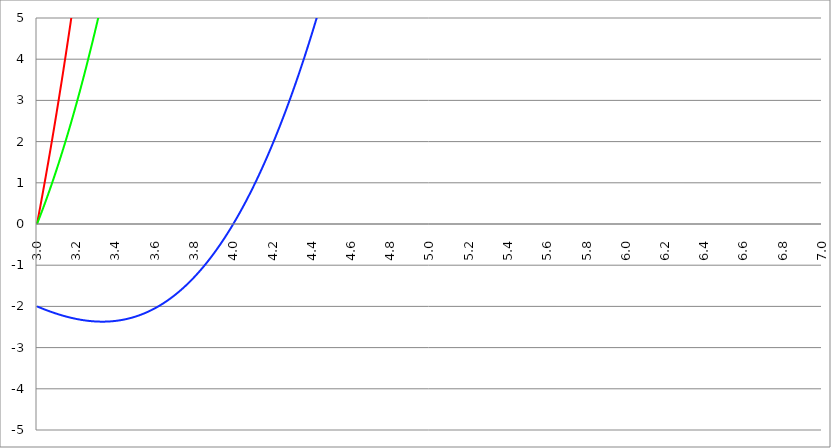
| Category | Series 1 | Series 0 | Series 2 |
|---|---|---|---|
| 3.0 | 0 | 0 | -2 |
| 3.002 | 0.05 | 0.024 | -2.004 |
| 3.004 | 0.1 | 0.048 | -2.008 |
| 3.005999999999999 | 0.151 | 0.072 | -2.012 |
| 3.008 | 0.201 | 0.097 | -2.016 |
| 3.009999999999999 | 0.252 | 0.121 | -2.02 |
| 3.011999999999999 | 0.303 | 0.146 | -2.024 |
| 3.013999999999998 | 0.354 | 0.17 | -2.028 |
| 3.015999999999998 | 0.405 | 0.195 | -2.031 |
| 3.017999999999998 | 0.457 | 0.22 | -2.035 |
| 3.019999999999998 | 0.508 | 0.245 | -2.039 |
| 3.021999999999998 | 0.56 | 0.27 | -2.043 |
| 3.023999999999997 | 0.612 | 0.295 | -2.047 |
| 3.025999999999997 | 0.664 | 0.32 | -2.051 |
| 3.027999999999997 | 0.716 | 0.345 | -2.054 |
| 3.029999999999997 | 0.768 | 0.371 | -2.058 |
| 3.031999999999996 | 0.821 | 0.396 | -2.062 |
| 3.033999999999996 | 0.873 | 0.422 | -2.066 |
| 3.035999999999996 | 0.926 | 0.448 | -2.069 |
| 3.037999999999996 | 0.979 | 0.473 | -2.073 |
| 3.039999999999996 | 1.032 | 0.499 | -2.077 |
| 3.041999999999995 | 1.086 | 0.525 | -2.08 |
| 3.043999999999995 | 1.139 | 0.551 | -2.084 |
| 3.045999999999995 | 1.193 | 0.578 | -2.088 |
| 3.047999999999995 | 1.247 | 0.604 | -2.091 |
| 3.049999999999994 | 1.3 | 0.63 | -2.095 |
| 3.051999999999994 | 1.355 | 0.657 | -2.098 |
| 3.053999999999994 | 1.409 | 0.683 | -2.102 |
| 3.055999999999994 | 1.463 | 0.71 | -2.105 |
| 3.057999999999994 | 1.518 | 0.737 | -2.109 |
| 3.059999999999993 | 1.573 | 0.764 | -2.112 |
| 3.061999999999993 | 1.628 | 0.791 | -2.116 |
| 3.063999999999993 | 1.683 | 0.818 | -2.119 |
| 3.065999999999993 | 1.738 | 0.845 | -2.123 |
| 3.067999999999992 | 1.794 | 0.872 | -2.126 |
| 3.069999999999992 | 1.849 | 0.9 | -2.13 |
| 3.071999999999992 | 1.905 | 0.927 | -2.133 |
| 3.073999999999992 | 1.961 | 0.955 | -2.136 |
| 3.075999999999992 | 2.017 | 0.983 | -2.14 |
| 3.077999999999991 | 2.074 | 1.01 | -2.143 |
| 3.079999999999991 | 2.13 | 1.038 | -2.146 |
| 3.081999999999991 | 2.187 | 1.066 | -2.149 |
| 3.083999999999991 | 2.243 | 1.094 | -2.153 |
| 3.085999999999991 | 2.3 | 1.123 | -2.156 |
| 3.08799999999999 | 2.358 | 1.151 | -2.159 |
| 3.08999999999999 | 2.415 | 1.179 | -2.162 |
| 3.09199999999999 | 2.472 | 1.208 | -2.166 |
| 3.09399999999999 | 2.53 | 1.237 | -2.169 |
| 3.095999999999989 | 2.588 | 1.265 | -2.172 |
| 3.097999999999989 | 2.646 | 1.294 | -2.175 |
| 3.099999999999989 | 2.704 | 1.323 | -2.178 |
| 3.101999999999989 | 2.762 | 1.352 | -2.181 |
| 3.103999999999989 | 2.821 | 1.381 | -2.184 |
| 3.105999999999988 | 2.879 | 1.41 | -2.187 |
| 3.107999999999988 | 2.938 | 1.44 | -2.19 |
| 3.109999999999988 | 2.997 | 1.469 | -2.193 |
| 3.111999999999988 | 3.056 | 1.499 | -2.196 |
| 3.113999999999987 | 3.116 | 1.528 | -2.199 |
| 3.115999999999987 | 3.175 | 1.558 | -2.202 |
| 3.117999999999987 | 3.235 | 1.588 | -2.205 |
| 3.119999999999987 | 3.295 | 1.618 | -2.208 |
| 3.121999999999987 | 3.355 | 1.648 | -2.211 |
| 3.123999999999986 | 3.415 | 1.678 | -2.213 |
| 3.125999999999986 | 3.476 | 1.709 | -2.216 |
| 3.127999999999986 | 3.536 | 1.739 | -2.219 |
| 3.129999999999986 | 3.597 | 1.769 | -2.222 |
| 3.131999999999985 | 3.658 | 1.8 | -2.225 |
| 3.133999999999985 | 3.719 | 1.831 | -2.227 |
| 3.135999999999985 | 3.78 | 1.861 | -2.23 |
| 3.137999999999985 | 3.841 | 1.892 | -2.233 |
| 3.139999999999985 | 3.903 | 1.923 | -2.235 |
| 3.141999999999984 | 3.965 | 1.955 | -2.238 |
| 3.143999999999984 | 4.027 | 1.986 | -2.241 |
| 3.145999999999984 | 4.089 | 2.017 | -2.243 |
| 3.147999999999984 | 4.151 | 2.049 | -2.246 |
| 3.149999999999983 | 4.213 | 2.08 | -2.248 |
| 3.151999999999983 | 4.276 | 2.112 | -2.251 |
| 3.153999999999983 | 4.339 | 2.144 | -2.253 |
| 3.155999999999983 | 4.402 | 2.175 | -2.256 |
| 3.157999999999983 | 4.465 | 2.207 | -2.258 |
| 3.159999999999982 | 4.528 | 2.239 | -2.261 |
| 3.161999999999982 | 4.592 | 2.272 | -2.263 |
| 3.163999999999982 | 4.656 | 2.304 | -2.265 |
| 3.165999999999982 | 4.719 | 2.336 | -2.268 |
| 3.167999999999981 | 4.783 | 2.369 | -2.27 |
| 3.169999999999981 | 4.848 | 2.402 | -2.272 |
| 3.171999999999981 | 4.912 | 2.434 | -2.275 |
| 3.173999999999981 | 4.977 | 2.467 | -2.277 |
| 3.175999999999981 | 5.041 | 2.5 | -2.279 |
| 3.17799999999998 | 5.106 | 2.533 | -2.281 |
| 3.17999999999998 | 5.171 | 2.566 | -2.284 |
| 3.18199999999998 | 5.237 | 2.6 | -2.286 |
| 3.18399999999998 | 5.302 | 2.633 | -2.288 |
| 3.185999999999979 | 5.368 | 2.666 | -2.29 |
| 3.18799999999998 | 5.433 | 2.7 | -2.292 |
| 3.18999999999998 | 5.499 | 2.734 | -2.294 |
| 3.191999999999979 | 5.566 | 2.768 | -2.296 |
| 3.193999999999979 | 5.632 | 2.802 | -2.298 |
| 3.195999999999978 | 5.698 | 2.836 | -2.3 |
| 3.197999999999978 | 5.765 | 2.87 | -2.302 |
| 3.199999999999978 | 5.832 | 2.904 | -2.304 |
| 3.201999999999978 | 5.899 | 2.938 | -2.306 |
| 3.203999999999977 | 5.966 | 2.973 | -2.308 |
| 3.205999999999977 | 6.034 | 3.007 | -2.31 |
| 3.207999999999977 | 6.101 | 3.042 | -2.311 |
| 3.209999999999977 | 6.169 | 3.077 | -2.313 |
| 3.211999999999977 | 6.237 | 3.112 | -2.315 |
| 3.213999999999976 | 6.305 | 3.147 | -2.317 |
| 3.215999999999976 | 6.373 | 3.182 | -2.319 |
| 3.217999999999976 | 6.442 | 3.217 | -2.32 |
| 3.219999999999976 | 6.511 | 3.253 | -2.322 |
| 3.221999999999976 | 6.579 | 3.288 | -2.324 |
| 3.223999999999975 | 6.648 | 3.324 | -2.325 |
| 3.225999999999975 | 6.718 | 3.36 | -2.327 |
| 3.227999999999975 | 6.787 | 3.395 | -2.328 |
| 3.229999999999975 | 6.857 | 3.431 | -2.33 |
| 3.231999999999974 | 6.926 | 3.467 | -2.331 |
| 3.233999999999974 | 6.996 | 3.504 | -2.333 |
| 3.235999999999974 | 7.066 | 3.54 | -2.334 |
| 3.237999999999974 | 7.137 | 3.576 | -2.336 |
| 3.239999999999974 | 7.207 | 3.613 | -2.337 |
| 3.241999999999973 | 7.278 | 3.649 | -2.339 |
| 3.243999999999973 | 7.349 | 3.686 | -2.34 |
| 3.245999999999973 | 7.42 | 3.723 | -2.341 |
| 3.247999999999972 | 7.491 | 3.76 | -2.342 |
| 3.249999999999972 | 7.562 | 3.797 | -2.344 |
| 3.251999999999972 | 7.634 | 3.834 | -2.345 |
| 3.253999999999972 | 7.706 | 3.871 | -2.346 |
| 3.255999999999972 | 7.778 | 3.909 | -2.347 |
| 3.257999999999972 | 7.85 | 3.946 | -2.349 |
| 3.259999999999971 | 7.922 | 3.984 | -2.35 |
| 3.261999999999971 | 7.995 | 4.022 | -2.351 |
| 3.263999999999971 | 8.068 | 4.06 | -2.352 |
| 3.265999999999971 | 8.14 | 4.098 | -2.353 |
| 3.26799999999997 | 8.213 | 4.136 | -2.354 |
| 3.26999999999997 | 8.287 | 4.174 | -2.355 |
| 3.27199999999997 | 8.36 | 4.212 | -2.356 |
| 3.27399999999997 | 8.434 | 4.251 | -2.357 |
| 3.27599999999997 | 8.508 | 4.289 | -2.358 |
| 3.277999999999969 | 8.582 | 4.328 | -2.358 |
| 3.279999999999969 | 8.656 | 4.367 | -2.359 |
| 3.281999999999969 | 8.73 | 4.406 | -2.36 |
| 3.283999999999969 | 8.805 | 4.445 | -2.361 |
| 3.285999999999968 | 8.879 | 4.484 | -2.362 |
| 3.287999999999968 | 8.954 | 4.523 | -2.362 |
| 3.289999999999968 | 9.03 | 4.562 | -2.363 |
| 3.291999999999968 | 9.105 | 4.602 | -2.364 |
| 3.293999999999968 | 9.18 | 4.641 | -2.364 |
| 3.295999999999967 | 9.256 | 4.681 | -2.365 |
| 3.297999999999967 | 9.332 | 4.721 | -2.365 |
| 3.299999999999967 | 9.408 | 4.761 | -2.366 |
| 3.301999999999967 | 9.484 | 4.801 | -2.367 |
| 3.303999999999966 | 9.561 | 4.841 | -2.367 |
| 3.305999999999966 | 9.637 | 4.882 | -2.367 |
| 3.307999999999966 | 9.714 | 4.922 | -2.368 |
| 3.309999999999966 | 9.791 | 4.963 | -2.368 |
| 3.311999999999966 | 9.868 | 5.003 | -2.369 |
| 3.313999999999965 | 9.946 | 5.044 | -2.369 |
| 3.315999999999965 | 10.023 | 5.085 | -2.369 |
| 3.317999999999965 | 10.101 | 5.126 | -2.369 |
| 3.319999999999965 | 10.179 | 5.167 | -2.37 |
| 3.321999999999964 | 10.257 | 5.208 | -2.37 |
| 3.323999999999964 | 10.336 | 5.25 | -2.37 |
| 3.325999999999964 | 10.414 | 5.291 | -2.37 |
| 3.327999999999964 | 10.493 | 5.333 | -2.37 |
| 3.329999999999964 | 10.572 | 5.375 | -2.37 |
| 3.331999999999963 | 10.651 | 5.416 | -2.37 |
| 3.333999999999963 | 10.73 | 5.458 | -2.37 |
| 3.335999999999963 | 10.81 | 5.501 | -2.37 |
| 3.337999999999963 | 10.889 | 5.543 | -2.37 |
| 3.339999999999963 | 10.969 | 5.585 | -2.37 |
| 3.341999999999962 | 11.049 | 5.628 | -2.37 |
| 3.343999999999962 | 11.13 | 5.67 | -2.37 |
| 3.345999999999962 | 11.21 | 5.713 | -2.37 |
| 3.347999999999962 | 11.291 | 5.756 | -2.37 |
| 3.349999999999961 | 11.371 | 5.799 | -2.369 |
| 3.351999999999961 | 11.453 | 5.842 | -2.369 |
| 3.353999999999961 | 11.534 | 5.885 | -2.369 |
| 3.355999999999961 | 11.615 | 5.928 | -2.368 |
| 3.357999999999961 | 11.697 | 5.972 | -2.368 |
| 3.35999999999996 | 11.779 | 6.015 | -2.367 |
| 3.36199999999996 | 11.861 | 6.059 | -2.367 |
| 3.36399999999996 | 11.943 | 6.103 | -2.367 |
| 3.36599999999996 | 12.025 | 6.147 | -2.366 |
| 3.367999999999959 | 12.108 | 6.191 | -2.365 |
| 3.369999999999959 | 12.191 | 6.235 | -2.365 |
| 3.371999999999959 | 12.274 | 6.279 | -2.364 |
| 3.373999999999959 | 12.357 | 6.323 | -2.364 |
| 3.375999999999959 | 12.44 | 6.368 | -2.363 |
| 3.377999999999958 | 12.524 | 6.413 | -2.362 |
| 3.379999999999958 | 12.607 | 6.457 | -2.361 |
| 3.381999999999958 | 12.691 | 6.502 | -2.361 |
| 3.383999999999958 | 12.776 | 6.547 | -2.36 |
| 3.385999999999957 | 12.86 | 6.592 | -2.359 |
| 3.387999999999957 | 12.945 | 6.638 | -2.358 |
| 3.389999999999957 | 13.029 | 6.683 | -2.357 |
| 3.391999999999957 | 13.114 | 6.729 | -2.356 |
| 3.393999999999957 | 13.199 | 6.774 | -2.355 |
| 3.395999999999956 | 13.285 | 6.82 | -2.354 |
| 3.397999999999956 | 13.37 | 6.866 | -2.353 |
| 3.399999999999956 | 13.456 | 6.912 | -2.352 |
| 3.401999999999956 | 13.542 | 6.958 | -2.351 |
| 3.403999999999955 | 13.628 | 7.004 | -2.35 |
| 3.405999999999955 | 13.714 | 7.051 | -2.348 |
| 3.407999999999955 | 13.801 | 7.097 | -2.347 |
| 3.409999999999955 | 13.888 | 7.144 | -2.346 |
| 3.411999999999955 | 13.975 | 7.191 | -2.345 |
| 3.413999999999954 | 14.062 | 7.238 | -2.343 |
| 3.415999999999954 | 14.149 | 7.285 | -2.342 |
| 3.417999999999954 | 14.237 | 7.332 | -2.34 |
| 3.419999999999954 | 14.324 | 7.379 | -2.339 |
| 3.421999999999953 | 14.412 | 7.426 | -2.338 |
| 3.423999999999953 | 14.5 | 7.474 | -2.336 |
| 3.425999999999953 | 14.589 | 7.522 | -2.334 |
| 3.427999999999953 | 14.677 | 7.569 | -2.333 |
| 3.429999999999953 | 14.766 | 7.617 | -2.331 |
| 3.431999999999952 | 14.855 | 7.665 | -2.33 |
| 3.433999999999952 | 14.944 | 7.714 | -2.328 |
| 3.435999999999952 | 15.033 | 7.762 | -2.326 |
| 3.437999999999952 | 15.123 | 7.81 | -2.324 |
| 3.439999999999952 | 15.213 | 7.859 | -2.322 |
| 3.441999999999951 | 15.303 | 7.907 | -2.321 |
| 3.443999999999951 | 15.393 | 7.956 | -2.319 |
| 3.445999999999951 | 15.483 | 8.005 | -2.317 |
| 3.447999999999951 | 15.574 | 8.054 | -2.315 |
| 3.44999999999995 | 15.664 | 8.103 | -2.313 |
| 3.45199999999995 | 15.755 | 8.153 | -2.311 |
| 3.45399999999995 | 15.847 | 8.202 | -2.309 |
| 3.45599999999995 | 15.938 | 8.252 | -2.306 |
| 3.45799999999995 | 16.03 | 8.301 | -2.304 |
| 3.459999999999949 | 16.121 | 8.351 | -2.302 |
| 3.461999999999949 | 16.213 | 8.401 | -2.3 |
| 3.463999999999949 | 16.306 | 8.451 | -2.298 |
| 3.465999999999949 | 16.398 | 8.501 | -2.295 |
| 3.467999999999948 | 16.49 | 8.552 | -2.293 |
| 3.469999999999948 | 16.583 | 8.602 | -2.291 |
| 3.471999999999948 | 16.676 | 8.653 | -2.288 |
| 3.473999999999948 | 16.77 | 8.704 | -2.286 |
| 3.475999999999948 | 16.863 | 8.754 | -2.283 |
| 3.477999999999947 | 16.957 | 8.805 | -2.281 |
| 3.479999999999947 | 17.05 | 8.857 | -2.278 |
| 3.481999999999947 | 17.144 | 8.908 | -2.275 |
| 3.483999999999947 | 17.239 | 8.959 | -2.273 |
| 3.485999999999946 | 17.333 | 9.011 | -2.27 |
| 3.487999999999946 | 17.428 | 9.062 | -2.267 |
| 3.489999999999946 | 17.523 | 9.114 | -2.265 |
| 3.491999999999946 | 17.618 | 9.166 | -2.262 |
| 3.493999999999946 | 17.713 | 9.218 | -2.259 |
| 3.495999999999945 | 17.808 | 9.27 | -2.256 |
| 3.497999999999945 | 17.904 | 9.323 | -2.253 |
| 3.499999999999945 | 18 | 9.375 | -2.25 |
| 3.501999999999945 | 18.096 | 9.428 | -2.247 |
| 3.503999999999944 | 18.192 | 9.48 | -2.244 |
| 3.505999999999944 | 18.289 | 9.533 | -2.241 |
| 3.507999999999944 | 18.386 | 9.586 | -2.238 |
| 3.509999999999944 | 18.483 | 9.639 | -2.234 |
| 3.511999999999944 | 18.58 | 9.692 | -2.231 |
| 3.513999999999943 | 18.677 | 9.746 | -2.228 |
| 3.515999999999943 | 18.775 | 9.799 | -2.225 |
| 3.517999999999943 | 18.872 | 9.853 | -2.221 |
| 3.519999999999943 | 18.97 | 9.907 | -2.218 |
| 3.521999999999943 | 19.069 | 9.961 | -2.215 |
| 3.523999999999942 | 19.167 | 10.015 | -2.211 |
| 3.525999999999942 | 19.266 | 10.069 | -2.208 |
| 3.527999999999942 | 19.364 | 10.123 | -2.204 |
| 3.529999999999942 | 19.464 | 10.177 | -2.2 |
| 3.531999999999941 | 19.563 | 10.232 | -2.197 |
| 3.533999999999941 | 19.662 | 10.287 | -2.193 |
| 3.535999999999941 | 19.762 | 10.342 | -2.189 |
| 3.537999999999941 | 19.862 | 10.396 | -2.186 |
| 3.539999999999941 | 19.962 | 10.452 | -2.182 |
| 3.54199999999994 | 20.062 | 10.507 | -2.178 |
| 3.54399999999994 | 20.163 | 10.562 | -2.174 |
| 3.54599999999994 | 20.263 | 10.618 | -2.17 |
| 3.54799999999994 | 20.364 | 10.673 | -2.166 |
| 3.549999999999939 | 20.465 | 10.729 | -2.162 |
| 3.551999999999939 | 20.567 | 10.785 | -2.158 |
| 3.553999999999939 | 20.668 | 10.841 | -2.154 |
| 3.555999999999939 | 20.77 | 10.897 | -2.15 |
| 3.557999999999939 | 20.872 | 10.954 | -2.146 |
| 3.559999999999938 | 20.974 | 11.01 | -2.142 |
| 3.561999999999938 | 21.077 | 11.067 | -2.137 |
| 3.563999999999938 | 21.18 | 11.123 | -2.133 |
| 3.565999999999938 | 21.282 | 11.18 | -2.129 |
| 3.567999999999937 | 21.385 | 11.237 | -2.124 |
| 3.569999999999937 | 21.489 | 11.294 | -2.12 |
| 3.571999999999937 | 21.592 | 11.352 | -2.115 |
| 3.573999999999937 | 21.696 | 11.409 | -2.111 |
| 3.575999999999937 | 21.8 | 11.467 | -2.106 |
| 3.577999999999936 | 21.904 | 11.524 | -2.102 |
| 3.579999999999936 | 22.008 | 11.582 | -2.097 |
| 3.581999999999936 | 22.113 | 11.64 | -2.092 |
| 3.583999999999936 | 22.218 | 11.698 | -2.088 |
| 3.585999999999935 | 22.323 | 11.756 | -2.083 |
| 3.587999999999935 | 22.428 | 11.815 | -2.078 |
| 3.589999999999935 | 22.534 | 11.873 | -2.073 |
| 3.591999999999935 | 22.639 | 11.932 | -2.068 |
| 3.593999999999935 | 22.745 | 11.991 | -2.063 |
| 3.595999999999934 | 22.851 | 12.05 | -2.058 |
| 3.597999999999934 | 22.957 | 12.109 | -2.053 |
| 3.599999999999934 | 23.064 | 12.168 | -2.048 |
| 3.601999999999934 | 23.171 | 12.227 | -2.043 |
| 3.603999999999933 | 23.278 | 12.287 | -2.038 |
| 3.605999999999933 | 23.385 | 12.346 | -2.032 |
| 3.607999999999933 | 23.492 | 12.406 | -2.027 |
| 3.609999999999933 | 23.6 | 12.466 | -2.022 |
| 3.611999999999933 | 23.708 | 12.526 | -2.016 |
| 3.613999999999932 | 23.816 | 12.586 | -2.011 |
| 3.615999999999932 | 23.924 | 12.647 | -2.006 |
| 3.617999999999932 | 24.033 | 12.707 | -2 |
| 3.619999999999932 | 24.141 | 12.768 | -1.995 |
| 3.621999999999931 | 24.25 | 12.829 | -1.989 |
| 3.623999999999931 | 24.359 | 12.889 | -1.983 |
| 3.625999999999931 | 24.469 | 12.95 | -1.978 |
| 3.627999999999931 | 24.578 | 13.012 | -1.972 |
| 3.629999999999931 | 24.688 | 13.073 | -1.966 |
| 3.63199999999993 | 24.798 | 13.134 | -1.96 |
| 3.63399999999993 | 24.908 | 13.196 | -1.954 |
| 3.63599999999993 | 25.019 | 13.258 | -1.948 |
| 3.63799999999993 | 25.13 | 13.32 | -1.943 |
| 3.639999999999929 | 25.241 | 13.382 | -1.937 |
| 3.641999999999929 | 25.352 | 13.444 | -1.93 |
| 3.643999999999929 | 25.463 | 13.506 | -1.924 |
| 3.645999999999929 | 25.575 | 13.569 | -1.918 |
| 3.647999999999929 | 25.686 | 13.631 | -1.912 |
| 3.649999999999928 | 25.798 | 13.694 | -1.906 |
| 3.651999999999928 | 25.911 | 13.757 | -1.899 |
| 3.653999999999928 | 26.023 | 13.82 | -1.893 |
| 3.655999999999928 | 26.136 | 13.883 | -1.887 |
| 3.657999999999927 | 26.249 | 13.946 | -1.88 |
| 3.659999999999927 | 26.362 | 14.01 | -1.874 |
| 3.661999999999927 | 26.475 | 14.073 | -1.867 |
| 3.663999999999927 | 26.589 | 14.137 | -1.861 |
| 3.665999999999927 | 26.703 | 14.201 | -1.854 |
| 3.667999999999926 | 26.817 | 14.265 | -1.847 |
| 3.669999999999926 | 26.931 | 14.329 | -1.841 |
| 3.671999999999926 | 27.046 | 14.393 | -1.834 |
| 3.673999999999926 | 27.16 | 14.458 | -1.827 |
| 3.675999999999925 | 27.275 | 14.522 | -1.82 |
| 3.677999999999925 | 27.39 | 14.587 | -1.813 |
| 3.679999999999925 | 27.506 | 14.652 | -1.806 |
| 3.681999999999925 | 27.621 | 14.717 | -1.799 |
| 3.683999999999925 | 27.737 | 14.782 | -1.792 |
| 3.685999999999924 | 27.853 | 14.848 | -1.785 |
| 3.687999999999924 | 27.97 | 14.913 | -1.778 |
| 3.689999999999924 | 28.086 | 14.979 | -1.771 |
| 3.691999999999924 | 28.203 | 15.044 | -1.764 |
| 3.693999999999923 | 28.32 | 15.11 | -1.756 |
| 3.695999999999923 | 28.437 | 15.176 | -1.749 |
| 3.697999999999923 | 28.554 | 15.243 | -1.741 |
| 3.699999999999923 | 28.672 | 15.309 | -1.734 |
| 3.701999999999923 | 28.79 | 15.375 | -1.726 |
| 3.703999999999922 | 28.908 | 15.442 | -1.719 |
| 3.705999999999922 | 29.026 | 15.509 | -1.711 |
| 3.707999999999922 | 29.145 | 15.576 | -1.704 |
| 3.709999999999922 | 29.264 | 15.643 | -1.696 |
| 3.711999999999922 | 29.383 | 15.71 | -1.688 |
| 3.713999999999921 | 29.502 | 15.778 | -1.68 |
| 3.715999999999921 | 29.621 | 15.845 | -1.673 |
| 3.717999999999921 | 29.741 | 15.913 | -1.665 |
| 3.719999999999921 | 29.861 | 15.981 | -1.657 |
| 3.72199999999992 | 29.981 | 16.049 | -1.649 |
| 3.72399999999992 | 30.102 | 16.117 | -1.641 |
| 3.72599999999992 | 30.222 | 16.185 | -1.633 |
| 3.72799999999992 | 30.343 | 16.253 | -1.624 |
| 3.72999999999992 | 30.464 | 16.322 | -1.616 |
| 3.731999999999919 | 30.585 | 16.391 | -1.608 |
| 3.73399999999992 | 30.707 | 16.459 | -1.6 |
| 3.735999999999919 | 30.829 | 16.528 | -1.591 |
| 3.737999999999919 | 30.951 | 16.598 | -1.583 |
| 3.739999999999918 | 31.073 | 16.667 | -1.574 |
| 3.741999999999918 | 31.195 | 16.736 | -1.566 |
| 3.743999999999918 | 31.318 | 16.806 | -1.557 |
| 3.745999999999918 | 31.441 | 16.876 | -1.549 |
| 3.747999999999917 | 31.564 | 16.946 | -1.54 |
| 3.749999999999917 | 31.687 | 17.016 | -1.531 |
| 3.751999999999917 | 31.811 | 17.086 | -1.522 |
| 3.753999999999917 | 31.935 | 17.156 | -1.514 |
| 3.755999999999917 | 32.059 | 17.227 | -1.505 |
| 3.757999999999916 | 32.183 | 17.297 | -1.496 |
| 3.759999999999916 | 32.308 | 17.368 | -1.487 |
| 3.761999999999916 | 32.433 | 17.439 | -1.478 |
| 3.763999999999916 | 32.558 | 17.51 | -1.469 |
| 3.765999999999916 | 32.683 | 17.581 | -1.46 |
| 3.767999999999915 | 32.808 | 17.653 | -1.45 |
| 3.769999999999915 | 32.934 | 17.724 | -1.441 |
| 3.771999999999915 | 33.06 | 17.796 | -1.432 |
| 3.773999999999915 | 33.186 | 17.868 | -1.422 |
| 3.775999999999914 | 33.313 | 17.94 | -1.413 |
| 3.777999999999914 | 33.439 | 18.012 | -1.404 |
| 3.779999999999914 | 33.566 | 18.084 | -1.394 |
| 3.781999999999914 | 33.693 | 18.157 | -1.385 |
| 3.783999999999913 | 33.821 | 18.23 | -1.375 |
| 3.785999999999913 | 33.948 | 18.302 | -1.365 |
| 3.787999999999913 | 34.076 | 18.375 | -1.356 |
| 3.789999999999913 | 34.204 | 18.448 | -1.346 |
| 3.791999999999913 | 34.332 | 18.522 | -1.336 |
| 3.793999999999912 | 34.461 | 18.595 | -1.326 |
| 3.795999999999912 | 34.59 | 18.668 | -1.316 |
| 3.797999999999912 | 34.719 | 18.742 | -1.306 |
| 3.799999999999912 | 34.848 | 18.816 | -1.296 |
| 3.801999999999912 | 34.977 | 18.89 | -1.286 |
| 3.803999999999911 | 35.107 | 18.964 | -1.276 |
| 3.805999999999911 | 35.237 | 19.038 | -1.266 |
| 3.807999999999911 | 35.367 | 19.113 | -1.255 |
| 3.809999999999911 | 35.498 | 19.188 | -1.245 |
| 3.811999999999911 | 35.628 | 19.262 | -1.235 |
| 3.81399999999991 | 35.759 | 19.337 | -1.224 |
| 3.81599999999991 | 35.89 | 19.412 | -1.214 |
| 3.81799999999991 | 36.022 | 19.488 | -1.203 |
| 3.81999999999991 | 36.153 | 19.563 | -1.192 |
| 3.821999999999909 | 36.285 | 19.638 | -1.182 |
| 3.823999999999909 | 36.417 | 19.714 | -1.171 |
| 3.825999999999909 | 36.55 | 19.79 | -1.16 |
| 3.827999999999909 | 36.682 | 19.866 | -1.15 |
| 3.829999999999909 | 36.815 | 19.942 | -1.139 |
| 3.831999999999908 | 36.948 | 20.018 | -1.128 |
| 3.833999999999908 | 37.081 | 20.095 | -1.117 |
| 3.835999999999908 | 37.215 | 20.172 | -1.106 |
| 3.837999999999908 | 37.349 | 20.248 | -1.095 |
| 3.839999999999907 | 37.483 | 20.325 | -1.083 |
| 3.841999999999907 | 37.617 | 20.402 | -1.072 |
| 3.843999999999907 | 37.752 | 20.48 | -1.061 |
| 3.845999999999907 | 37.886 | 20.557 | -1.05 |
| 3.847999999999907 | 38.021 | 20.635 | -1.038 |
| 3.849999999999906 | 38.156 | 20.712 | -1.027 |
| 3.851999999999906 | 38.292 | 20.79 | -1.015 |
| 3.853999999999906 | 38.428 | 20.868 | -1.004 |
| 3.855999999999906 | 38.564 | 20.946 | -0.992 |
| 3.857999999999905 | 38.7 | 21.025 | -0.98 |
| 3.859999999999905 | 38.836 | 21.103 | -0.969 |
| 3.861999999999905 | 38.973 | 21.182 | -0.957 |
| 3.863999999999905 | 39.11 | 21.261 | -0.945 |
| 3.865999999999905 | 39.247 | 21.34 | -0.933 |
| 3.867999999999904 | 39.384 | 21.419 | -0.921 |
| 3.869999999999904 | 39.522 | 21.498 | -0.909 |
| 3.871999999999904 | 39.66 | 21.578 | -0.897 |
| 3.873999999999904 | 39.798 | 21.657 | -0.885 |
| 3.875999999999903 | 39.936 | 21.737 | -0.873 |
| 3.877999999999903 | 40.075 | 21.817 | -0.861 |
| 3.879999999999903 | 40.214 | 21.897 | -0.848 |
| 3.881999999999903 | 40.353 | 21.977 | -0.836 |
| 3.883999999999903 | 40.492 | 22.058 | -0.823 |
| 3.885999999999902 | 40.632 | 22.138 | -0.811 |
| 3.887999999999902 | 40.772 | 22.219 | -0.798 |
| 3.889999999999902 | 40.912 | 22.3 | -0.786 |
| 3.891999999999902 | 41.052 | 22.381 | -0.773 |
| 3.893999999999901 | 41.193 | 22.462 | -0.76 |
| 3.895999999999901 | 41.334 | 22.544 | -0.748 |
| 3.897999999999901 | 41.475 | 22.625 | -0.735 |
| 3.899999999999901 | 41.616 | 22.707 | -0.722 |
| 3.901999999999901 | 41.758 | 22.789 | -0.709 |
| 3.9039999999999 | 41.899 | 22.871 | -0.696 |
| 3.9059999999999 | 42.041 | 22.953 | -0.683 |
| 3.9079999999999 | 42.184 | 23.035 | -0.67 |
| 3.9099999999999 | 42.326 | 23.118 | -0.657 |
| 3.9119999999999 | 42.469 | 23.201 | -0.643 |
| 3.913999999999899 | 42.612 | 23.283 | -0.63 |
| 3.915999999999899 | 42.755 | 23.366 | -0.617 |
| 3.917999999999899 | 42.899 | 23.45 | -0.603 |
| 3.919999999999899 | 43.043 | 23.533 | -0.59 |
| 3.921999999999898 | 43.187 | 23.616 | -0.576 |
| 3.923999999999898 | 43.331 | 23.7 | -0.563 |
| 3.925999999999898 | 43.476 | 23.784 | -0.549 |
| 3.927999999999898 | 43.62 | 23.868 | -0.535 |
| 3.929999999999898 | 43.765 | 23.952 | -0.521 |
| 3.931999999999897 | 43.911 | 24.036 | -0.508 |
| 3.933999999999897 | 44.056 | 24.121 | -0.494 |
| 3.935999999999897 | 44.202 | 24.205 | -0.48 |
| 3.937999999999897 | 44.348 | 24.29 | -0.466 |
| 3.939999999999896 | 44.494 | 24.375 | -0.452 |
| 3.941999999999896 | 44.641 | 24.46 | -0.437 |
| 3.943999999999896 | 44.788 | 24.545 | -0.423 |
| 3.945999999999896 | 44.935 | 24.631 | -0.409 |
| 3.947999999999896 | 45.082 | 24.716 | -0.395 |
| 3.949999999999895 | 45.229 | 24.802 | -0.38 |
| 3.951999999999895 | 45.377 | 24.888 | -0.366 |
| 3.953999999999895 | 45.525 | 24.974 | -0.351 |
| 3.955999999999895 | 45.674 | 25.06 | -0.337 |
| 3.957999999999894 | 45.822 | 25.147 | -0.322 |
| 3.959999999999894 | 45.971 | 25.233 | -0.307 |
| 3.961999999999894 | 46.12 | 25.32 | -0.293 |
| 3.963999999999894 | 46.269 | 25.407 | -0.278 |
| 3.965999999999894 | 46.419 | 25.494 | -0.263 |
| 3.967999999999893 | 46.569 | 25.581 | -0.248 |
| 3.969999999999893 | 46.719 | 25.669 | -0.233 |
| 3.971999999999893 | 46.869 | 25.756 | -0.218 |
| 3.973999999999893 | 47.02 | 25.844 | -0.203 |
| 3.975999999999892 | 47.17 | 25.932 | -0.187 |
| 3.977999999999892 | 47.321 | 26.02 | -0.172 |
| 3.979999999999892 | 47.473 | 26.108 | -0.157 |
| 3.981999999999892 | 47.624 | 26.197 | -0.141 |
| 3.983999999999892 | 47.776 | 26.285 | -0.126 |
| 3.985999999999891 | 47.928 | 26.374 | -0.11 |
| 3.987999999999891 | 48.081 | 26.463 | -0.095 |
| 3.989999999999891 | 48.233 | 26.552 | -0.079 |
| 3.991999999999891 | 48.386 | 26.641 | -0.063 |
| 3.99399999999989 | 48.539 | 26.731 | -0.048 |
| 3.99599999999989 | 48.693 | 26.82 | -0.032 |
| 3.99799999999989 | 48.846 | 26.91 | -0.016 |
| 3.99999999999989 | 49 | 27 | 0 |
| 4.00199999999989 | 49.154 | 27.09 | 0.016 |
| 4.00399999999989 | 49.309 | 27.18 | 0.032 |
| 4.00599999999989 | 49.463 | 27.271 | 0.048 |
| 4.007999999999889 | 49.618 | 27.361 | 0.065 |
| 4.009999999999888 | 49.773 | 27.452 | 0.081 |
| 4.011999999999888 | 49.929 | 27.543 | 0.097 |
| 4.013999999999888 | 50.084 | 27.634 | 0.114 |
| 4.015999999999888 | 50.24 | 27.725 | 0.13 |
| 4.017999999999888 | 50.396 | 27.817 | 0.147 |
| 4.019999999999887 | 50.553 | 27.908 | 0.163 |
| 4.021999999999887 | 50.71 | 28 | 0.18 |
| 4.023999999999887 | 50.866 | 28.092 | 0.197 |
| 4.025999999999887 | 51.024 | 28.184 | 0.213 |
| 4.027999999999887 | 51.181 | 28.277 | 0.23 |
| 4.029999999999886 | 51.339 | 28.369 | 0.247 |
| 4.031999999999886 | 51.497 | 28.462 | 0.264 |
| 4.033999999999886 | 51.655 | 28.554 | 0.281 |
| 4.035999999999885 | 51.814 | 28.647 | 0.298 |
| 4.037999999999885 | 51.972 | 28.74 | 0.316 |
| 4.039999999999885 | 52.131 | 28.834 | 0.333 |
| 4.041999999999885 | 52.291 | 28.927 | 0.35 |
| 4.043999999999885 | 52.45 | 29.021 | 0.368 |
| 4.045999999999884 | 52.61 | 29.115 | 0.385 |
| 4.047999999999884 | 52.77 | 29.209 | 0.403 |
| 4.049999999999884 | 52.93 | 29.303 | 0.42 |
| 4.051999999999884 | 53.091 | 29.397 | 0.438 |
| 4.053999999999884 | 53.252 | 29.492 | 0.456 |
| 4.055999999999884 | 53.413 | 29.586 | 0.473 |
| 4.057999999999883 | 53.574 | 29.681 | 0.491 |
| 4.059999999999883 | 53.736 | 29.776 | 0.509 |
| 4.061999999999883 | 53.898 | 29.871 | 0.527 |
| 4.063999999999883 | 54.06 | 29.967 | 0.545 |
| 4.065999999999883 | 54.223 | 30.062 | 0.563 |
| 4.067999999999882 | 54.385 | 30.158 | 0.582 |
| 4.069999999999882 | 54.548 | 30.254 | 0.6 |
| 4.071999999999881 | 54.711 | 30.35 | 0.618 |
| 4.073999999999881 | 54.875 | 30.446 | 0.637 |
| 4.075999999999881 | 55.039 | 30.543 | 0.655 |
| 4.077999999999881 | 55.203 | 30.639 | 0.674 |
| 4.07999999999988 | 55.367 | 30.736 | 0.692 |
| 4.08199999999988 | 55.531 | 30.833 | 0.711 |
| 4.08399999999988 | 55.696 | 30.93 | 0.73 |
| 4.08599999999988 | 55.861 | 31.027 | 0.748 |
| 4.08799999999988 | 56.027 | 31.125 | 0.767 |
| 4.08999999999988 | 56.192 | 31.222 | 0.786 |
| 4.09199999999988 | 56.358 | 31.32 | 0.805 |
| 4.09399999999988 | 56.524 | 31.418 | 0.824 |
| 4.09599999999988 | 56.69 | 31.516 | 0.843 |
| 4.09799999999988 | 56.857 | 31.615 | 0.863 |
| 4.099999999999878 | 57.024 | 31.713 | 0.882 |
| 4.101999999999878 | 57.191 | 31.812 | 0.901 |
| 4.103999999999878 | 57.359 | 31.911 | 0.921 |
| 4.105999999999878 | 57.526 | 32.01 | 0.94 |
| 4.107999999999878 | 57.694 | 32.109 | 0.96 |
| 4.109999999999877 | 57.863 | 32.208 | 0.979 |
| 4.111999999999877 | 58.031 | 32.308 | 0.999 |
| 4.113999999999877 | 58.2 | 32.407 | 1.019 |
| 4.115999999999877 | 58.369 | 32.507 | 1.039 |
| 4.117999999999877 | 58.538 | 32.607 | 1.059 |
| 4.119999999999876 | 58.708 | 32.708 | 1.079 |
| 4.121999999999876 | 58.878 | 32.808 | 1.099 |
| 4.123999999999876 | 59.048 | 32.909 | 1.119 |
| 4.125999999999876 | 59.218 | 33.009 | 1.139 |
| 4.127999999999876 | 59.389 | 33.11 | 1.159 |
| 4.129999999999875 | 59.56 | 33.211 | 1.18 |
| 4.131999999999875 | 59.731 | 33.313 | 1.2 |
| 4.133999999999875 | 59.902 | 33.414 | 1.22 |
| 4.135999999999874 | 60.074 | 33.516 | 1.241 |
| 4.137999999999874 | 60.246 | 33.618 | 1.262 |
| 4.139999999999874 | 60.418 | 33.72 | 1.282 |
| 4.141999999999874 | 60.591 | 33.822 | 1.303 |
| 4.143999999999874 | 60.763 | 33.924 | 1.324 |
| 4.145999999999874 | 60.937 | 34.027 | 1.345 |
| 4.147999999999874 | 61.11 | 34.13 | 1.366 |
| 4.149999999999873 | 61.283 | 34.233 | 1.387 |
| 4.151999999999873 | 61.457 | 34.336 | 1.408 |
| 4.153999999999873 | 61.632 | 34.439 | 1.429 |
| 4.155999999999873 | 61.806 | 34.542 | 1.45 |
| 4.157999999999872 | 61.981 | 34.646 | 1.472 |
| 4.159999999999872 | 62.156 | 34.75 | 1.493 |
| 4.161999999999872 | 62.331 | 34.854 | 1.514 |
| 4.163999999999872 | 62.506 | 34.958 | 1.536 |
| 4.165999999999872 | 62.682 | 35.062 | 1.558 |
| 4.167999999999871 | 62.858 | 35.167 | 1.579 |
| 4.169999999999871 | 63.034 | 35.272 | 1.601 |
| 4.17199999999987 | 63.211 | 35.377 | 1.623 |
| 4.17399999999987 | 63.388 | 35.482 | 1.645 |
| 4.17599999999987 | 63.565 | 35.587 | 1.667 |
| 4.17799999999987 | 63.742 | 35.692 | 1.689 |
| 4.17999999999987 | 63.92 | 35.798 | 1.711 |
| 4.18199999999987 | 64.098 | 35.904 | 1.733 |
| 4.18399999999987 | 64.276 | 36.01 | 1.755 |
| 4.18599999999987 | 64.455 | 36.116 | 1.778 |
| 4.18799999999987 | 64.634 | 36.222 | 1.8 |
| 4.189999999999868 | 64.813 | 36.329 | 1.823 |
| 4.191999999999868 | 64.992 | 36.435 | 1.845 |
| 4.193999999999868 | 65.172 | 36.542 | 1.868 |
| 4.195999999999868 | 65.351 | 36.649 | 1.89 |
| 4.197999999999868 | 65.532 | 36.757 | 1.913 |
| 4.199999999999867 | 65.712 | 36.864 | 1.936 |
| 4.201999999999867 | 65.893 | 36.972 | 1.959 |
| 4.203999999999867 | 66.074 | 37.079 | 1.982 |
| 4.205999999999867 | 66.255 | 37.187 | 2.005 |
| 4.207999999999866 | 66.436 | 37.296 | 2.028 |
| 4.209999999999866 | 66.618 | 37.404 | 2.051 |
| 4.211999999999866 | 66.8 | 37.512 | 2.075 |
| 4.213999999999866 | 66.983 | 37.621 | 2.098 |
| 4.215999999999866 | 67.165 | 37.73 | 2.121 |
| 4.217999999999865 | 67.348 | 37.839 | 2.145 |
| 4.219999999999865 | 67.531 | 37.948 | 2.168 |
| 4.221999999999865 | 67.715 | 38.058 | 2.192 |
| 4.223999999999865 | 67.899 | 38.167 | 2.216 |
| 4.225999999999864 | 68.083 | 38.277 | 2.24 |
| 4.227999999999864 | 68.267 | 38.387 | 2.264 |
| 4.229999999999864 | 68.451 | 38.497 | 2.288 |
| 4.231999999999864 | 68.636 | 38.608 | 2.312 |
| 4.233999999999864 | 68.821 | 38.718 | 2.336 |
| 4.235999999999863 | 69.007 | 38.829 | 2.36 |
| 4.237999999999863 | 69.193 | 38.94 | 2.384 |
| 4.239999999999863 | 69.378 | 39.051 | 2.408 |
| 4.241999999999863 | 69.565 | 39.162 | 2.433 |
| 4.243999999999862 | 69.751 | 39.274 | 2.457 |
| 4.245999999999862 | 69.938 | 39.385 | 2.482 |
| 4.247999999999862 | 70.125 | 39.497 | 2.507 |
| 4.249999999999862 | 70.312 | 39.609 | 2.531 |
| 4.251999999999862 | 70.5 | 39.722 | 2.556 |
| 4.253999999999861 | 70.688 | 39.834 | 2.581 |
| 4.255999999999861 | 70.876 | 39.947 | 2.606 |
| 4.257999999999861 | 71.065 | 40.059 | 2.631 |
| 4.25999999999986 | 71.254 | 40.172 | 2.656 |
| 4.26199999999986 | 71.443 | 40.285 | 2.681 |
| 4.26399999999986 | 71.632 | 40.399 | 2.706 |
| 4.26599999999986 | 71.821 | 40.512 | 2.732 |
| 4.26799999999986 | 72.011 | 40.626 | 2.757 |
| 4.26999999999986 | 72.202 | 40.74 | 2.783 |
| 4.27199999999986 | 72.392 | 40.854 | 2.808 |
| 4.27399999999986 | 72.583 | 40.968 | 2.834 |
| 4.27599999999986 | 72.774 | 41.083 | 2.859 |
| 4.27799999999986 | 72.965 | 41.197 | 2.885 |
| 4.27999999999986 | 73.157 | 41.312 | 2.911 |
| 4.281999999999858 | 73.348 | 41.427 | 2.937 |
| 4.283999999999858 | 73.541 | 41.542 | 2.963 |
| 4.285999999999858 | 73.733 | 41.658 | 2.989 |
| 4.287999999999858 | 73.926 | 41.773 | 3.015 |
| 4.289999999999857 | 74.119 | 41.889 | 3.042 |
| 4.291999999999857 | 74.312 | 42.005 | 3.068 |
| 4.293999999999857 | 74.506 | 42.121 | 3.094 |
| 4.295999999999857 | 74.699 | 42.238 | 3.121 |
| 4.297999999999857 | 74.894 | 42.354 | 3.147 |
| 4.299999999999856 | 75.088 | 42.471 | 3.174 |
| 4.301999999999856 | 75.283 | 42.588 | 3.201 |
| 4.303999999999856 | 75.478 | 42.705 | 3.228 |
| 4.305999999999856 | 75.673 | 42.822 | 3.254 |
| 4.307999999999856 | 75.869 | 42.94 | 3.281 |
| 4.309999999999855 | 76.064 | 43.057 | 3.308 |
| 4.311999999999855 | 76.26 | 43.175 | 3.335 |
| 4.313999999999855 | 76.457 | 43.293 | 3.363 |
| 4.315999999999855 | 76.654 | 43.412 | 3.39 |
| 4.317999999999855 | 76.851 | 43.53 | 3.417 |
| 4.319999999999854 | 77.048 | 43.649 | 3.445 |
| 4.321999999999854 | 77.245 | 43.768 | 3.472 |
| 4.323999999999854 | 77.443 | 43.887 | 3.5 |
| 4.325999999999854 | 77.641 | 44.006 | 3.527 |
| 4.327999999999854 | 77.84 | 44.125 | 3.555 |
| 4.329999999999853 | 78.039 | 44.245 | 3.583 |
| 4.331999999999853 | 78.238 | 44.364 | 3.611 |
| 4.333999999999853 | 78.437 | 44.484 | 3.639 |
| 4.335999999999853 | 78.636 | 44.605 | 3.667 |
| 4.337999999999853 | 78.836 | 44.725 | 3.695 |
| 4.339999999999852 | 79.036 | 44.846 | 3.723 |
| 4.341999999999852 | 79.237 | 44.966 | 3.752 |
| 4.343999999999852 | 79.438 | 45.087 | 3.78 |
| 4.345999999999852 | 79.639 | 45.208 | 3.809 |
| 4.347999999999851 | 79.84 | 45.33 | 3.837 |
| 4.349999999999851 | 80.041 | 45.451 | 3.866 |
| 4.351999999999851 | 80.243 | 45.573 | 3.894 |
| 4.353999999999851 | 80.446 | 45.695 | 3.923 |
| 4.355999999999851 | 80.648 | 45.817 | 3.952 |
| 4.35799999999985 | 80.851 | 45.939 | 3.981 |
| 4.35999999999985 | 81.054 | 46.062 | 4.01 |
| 4.36199999999985 | 81.257 | 46.184 | 4.039 |
| 4.36399999999985 | 81.461 | 46.307 | 4.068 |
| 4.365999999999849 | 81.665 | 46.43 | 4.098 |
| 4.367999999999849 | 81.869 | 46.553 | 4.127 |
| 4.36999999999985 | 82.073 | 46.677 | 4.157 |
| 4.371999999999848 | 82.278 | 46.801 | 4.186 |
| 4.373999999999848 | 82.483 | 46.924 | 4.216 |
| 4.375999999999848 | 82.689 | 47.048 | 4.245 |
| 4.377999999999848 | 82.894 | 47.173 | 4.275 |
| 4.379999999999847 | 83.1 | 47.297 | 4.305 |
| 4.381999999999847 | 83.307 | 47.422 | 4.335 |
| 4.383999999999847 | 83.513 | 47.546 | 4.365 |
| 4.385999999999847 | 83.72 | 47.671 | 4.395 |
| 4.387999999999847 | 83.927 | 47.797 | 4.425 |
| 4.389999999999846 | 84.134 | 47.922 | 4.455 |
| 4.391999999999846 | 84.342 | 48.048 | 4.486 |
| 4.393999999999846 | 84.55 | 48.173 | 4.516 |
| 4.395999999999846 | 84.759 | 48.299 | 4.547 |
| 4.397999999999846 | 84.967 | 48.426 | 4.577 |
| 4.399999999999845 | 85.176 | 48.552 | 4.608 |
| 4.401999999999845 | 85.385 | 48.679 | 4.639 |
| 4.403999999999845 | 85.595 | 48.805 | 4.67 |
| 4.405999999999845 | 85.804 | 48.932 | 4.701 |
| 4.407999999999844 | 86.015 | 49.059 | 4.732 |
| 4.409999999999844 | 86.225 | 49.187 | 4.763 |
| 4.411999999999844 | 86.436 | 49.314 | 4.794 |
| 4.413999999999844 | 86.647 | 49.442 | 4.825 |
| 4.415999999999844 | 86.858 | 49.57 | 4.856 |
| 4.417999999999844 | 87.069 | 49.698 | 4.888 |
| 4.419999999999843 | 87.281 | 49.827 | 4.919 |
| 4.421999999999843 | 87.493 | 49.955 | 4.951 |
| 4.423999999999843 | 87.706 | 50.084 | 4.983 |
| 4.425999999999843 | 87.918 | 50.213 | 5.014 |
| 4.427999999999843 | 88.131 | 50.342 | 5.046 |
| 4.429999999999842 | 88.345 | 50.471 | 5.078 |
| 4.431999999999842 | 88.558 | 50.601 | 5.11 |
| 4.433999999999842 | 88.772 | 50.731 | 5.142 |
| 4.435999999999841 | 88.987 | 50.861 | 5.175 |
| 4.437999999999841 | 89.201 | 50.991 | 5.207 |
| 4.43999999999984 | 89.416 | 51.121 | 5.239 |
| 4.44199999999984 | 89.631 | 51.252 | 5.272 |
| 4.44399999999984 | 89.846 | 51.382 | 5.304 |
| 4.44599999999984 | 90.062 | 51.513 | 5.337 |
| 4.44799999999984 | 90.278 | 51.645 | 5.369 |
| 4.44999999999984 | 90.494 | 51.776 | 5.402 |
| 4.45199999999984 | 90.711 | 51.907 | 5.435 |
| 4.45399999999984 | 90.928 | 52.039 | 5.468 |
| 4.45599999999984 | 91.145 | 52.171 | 5.501 |
| 4.45799999999984 | 91.363 | 52.303 | 5.534 |
| 4.45999999999984 | 91.581 | 52.436 | 5.567 |
| 4.461999999999838 | 91.799 | 52.568 | 5.601 |
| 4.463999999999838 | 92.017 | 52.701 | 5.634 |
| 4.465999999999838 | 92.236 | 52.834 | 5.668 |
| 4.467999999999838 | 92.455 | 52.967 | 5.701 |
| 4.469999999999838 | 92.674 | 53.1 | 5.735 |
| 4.471999999999837 | 92.894 | 53.234 | 5.769 |
| 4.473999999999837 | 93.114 | 53.368 | 5.802 |
| 4.475999999999837 | 93.334 | 53.502 | 5.836 |
| 4.477999999999837 | 93.554 | 53.636 | 5.87 |
| 4.479999999999836 | 93.775 | 53.77 | 5.904 |
| 4.481999999999836 | 93.996 | 53.905 | 5.939 |
| 4.483999999999836 | 94.218 | 54.04 | 5.973 |
| 4.485999999999836 | 94.439 | 54.174 | 6.007 |
| 4.487999999999836 | 94.661 | 54.31 | 6.042 |
| 4.489999999999835 | 94.884 | 54.445 | 6.076 |
| 4.491999999999835 | 95.106 | 54.581 | 6.111 |
| 4.493999999999835 | 95.329 | 54.716 | 6.145 |
| 4.495999999999835 | 95.553 | 54.852 | 6.18 |
| 4.497999999999834 | 95.776 | 54.989 | 6.215 |
| 4.499999999999834 | 96 | 55.125 | 6.25 |
| 4.501999999999834 | 96.224 | 55.262 | 6.285 |
| 4.503999999999834 | 96.449 | 55.398 | 6.32 |
| 4.505999999999834 | 96.673 | 55.535 | 6.355 |
| 4.507999999999834 | 96.898 | 55.673 | 6.391 |
| 4.509999999999833 | 97.124 | 55.81 | 6.426 |
| 4.511999999999833 | 97.349 | 55.948 | 6.462 |
| 4.513999999999833 | 97.575 | 56.086 | 6.497 |
| 4.515999999999833 | 97.802 | 56.224 | 6.533 |
| 4.517999999999833 | 98.028 | 56.362 | 6.569 |
| 4.519999999999832 | 98.255 | 56.5 | 6.604 |
| 4.521999999999832 | 98.482 | 56.639 | 6.64 |
| 4.523999999999832 | 98.71 | 56.778 | 6.676 |
| 4.525999999999832 | 98.938 | 56.917 | 6.712 |
| 4.527999999999832 | 99.166 | 57.056 | 6.749 |
| 4.529999999999831 | 99.394 | 57.196 | 6.785 |
| 4.53199999999983 | 99.623 | 57.335 | 6.821 |
| 4.53399999999983 | 99.852 | 57.475 | 6.858 |
| 4.53599999999983 | 100.081 | 57.615 | 6.894 |
| 4.53799999999983 | 100.311 | 57.755 | 6.931 |
| 4.53999999999983 | 100.541 | 57.896 | 6.968 |
| 4.54199999999983 | 100.771 | 58.037 | 7.005 |
| 4.54399999999983 | 101.002 | 58.178 | 7.041 |
| 4.54599999999983 | 101.233 | 58.319 | 7.078 |
| 4.54799999999983 | 101.464 | 58.46 | 7.116 |
| 4.54999999999983 | 101.695 | 58.602 | 7.153 |
| 4.55199999999983 | 101.927 | 58.743 | 7.19 |
| 4.553999999999828 | 102.159 | 58.885 | 7.227 |
| 4.555999999999828 | 102.392 | 59.027 | 7.265 |
| 4.557999999999828 | 102.625 | 59.17 | 7.302 |
| 4.559999999999828 | 102.858 | 59.312 | 7.34 |
| 4.561999999999827 | 103.091 | 59.455 | 7.378 |
| 4.563999999999827 | 103.325 | 59.598 | 7.416 |
| 4.565999999999827 | 103.559 | 59.741 | 7.453 |
| 4.567999999999827 | 103.793 | 59.885 | 7.491 |
| 4.569999999999827 | 104.028 | 60.028 | 7.53 |
| 4.571999999999826 | 104.262 | 60.172 | 7.568 |
| 4.573999999999826 | 104.498 | 60.316 | 7.606 |
| 4.575999999999826 | 104.733 | 60.461 | 7.644 |
| 4.577999999999826 | 104.969 | 60.605 | 7.683 |
| 4.579999999999825 | 105.205 | 60.75 | 7.721 |
| 4.581999999999825 | 105.442 | 60.895 | 7.76 |
| 4.583999999999825 | 105.678 | 61.04 | 7.799 |
| 4.585999999999825 | 105.916 | 61.185 | 7.838 |
| 4.587999999999825 | 106.153 | 61.331 | 7.877 |
| 4.589999999999824 | 106.391 | 61.476 | 7.916 |
| 4.591999999999824 | 106.629 | 61.622 | 7.955 |
| 4.593999999999824 | 106.867 | 61.768 | 7.994 |
| 4.595999999999824 | 107.106 | 61.915 | 8.033 |
| 4.597999999999824 | 107.345 | 62.061 | 8.073 |
| 4.599999999999823 | 107.584 | 62.208 | 8.112 |
| 4.601999999999823 | 107.824 | 62.355 | 8.152 |
| 4.603999999999823 | 108.064 | 62.502 | 8.191 |
| 4.605999999999823 | 108.304 | 62.65 | 8.231 |
| 4.607999999999823 | 108.544 | 62.797 | 8.271 |
| 4.609999999999822 | 108.785 | 62.945 | 8.311 |
| 4.611999999999822 | 109.026 | 63.093 | 8.351 |
| 4.613999999999822 | 109.268 | 63.241 | 8.391 |
| 4.615999999999822 | 109.51 | 63.39 | 8.431 |
| 4.617999999999822 | 109.752 | 63.538 | 8.471 |
| 4.619999999999821 | 109.994 | 63.687 | 8.512 |
| 4.621999999999821 | 110.237 | 63.836 | 8.552 |
| 4.623999999999821 | 110.48 | 63.986 | 8.593 |
| 4.625999999999821 | 110.723 | 64.135 | 8.634 |
| 4.627999999999821 | 110.967 | 64.285 | 8.674 |
| 4.62999999999982 | 111.211 | 64.435 | 8.715 |
| 4.63199999999982 | 111.455 | 64.585 | 8.756 |
| 4.63399999999982 | 111.7 | 64.736 | 8.797 |
| 4.63599999999982 | 111.945 | 64.886 | 8.838 |
| 4.63799999999982 | 112.19 | 65.037 | 8.88 |
| 4.63999999999982 | 112.436 | 65.188 | 8.921 |
| 4.64199999999982 | 112.682 | 65.339 | 8.963 |
| 4.643999999999819 | 112.928 | 65.491 | 9.004 |
| 4.645999999999819 | 113.174 | 65.642 | 9.046 |
| 4.647999999999818 | 113.421 | 65.794 | 9.087 |
| 4.649999999999818 | 113.668 | 65.946 | 9.129 |
| 4.651999999999818 | 113.916 | 66.099 | 9.171 |
| 4.653999999999818 | 114.164 | 66.251 | 9.213 |
| 4.655999999999818 | 114.412 | 66.404 | 9.255 |
| 4.657999999999817 | 114.66 | 66.557 | 9.297 |
| 4.659999999999817 | 114.909 | 66.71 | 9.34 |
| 4.661999999999817 | 115.158 | 66.863 | 9.382 |
| 4.663999999999817 | 115.408 | 67.017 | 9.425 |
| 4.665999999999816 | 115.657 | 67.171 | 9.467 |
| 4.667999999999816 | 115.907 | 67.325 | 9.51 |
| 4.669999999999816 | 116.158 | 67.479 | 9.553 |
| 4.671999999999815 | 116.409 | 67.634 | 9.596 |
| 4.673999999999815 | 116.66 | 67.788 | 9.639 |
| 4.675999999999815 | 116.911 | 67.943 | 9.682 |
| 4.677999999999815 | 117.163 | 68.098 | 9.725 |
| 4.679999999999814 | 117.415 | 68.254 | 9.768 |
| 4.681999999999814 | 117.667 | 68.409 | 9.811 |
| 4.683999999999814 | 117.919 | 68.565 | 9.855 |
| 4.685999999999814 | 118.172 | 68.721 | 9.898 |
| 4.687999999999814 | 118.426 | 68.877 | 9.942 |
| 4.689999999999814 | 118.679 | 69.034 | 9.986 |
| 4.691999999999814 | 118.933 | 69.19 | 10.03 |
| 4.693999999999813 | 119.187 | 69.347 | 10.074 |
| 4.695999999999813 | 119.442 | 69.504 | 10.118 |
| 4.697999999999813 | 119.697 | 69.661 | 10.162 |
| 4.699999999999813 | 119.952 | 69.819 | 10.206 |
| 4.701999999999812 | 120.208 | 69.977 | 10.25 |
| 4.703999999999812 | 120.463 | 70.135 | 10.295 |
| 4.705999999999812 | 120.72 | 70.293 | 10.339 |
| 4.707999999999812 | 120.976 | 70.451 | 10.384 |
| 4.709999999999811 | 121.233 | 70.61 | 10.429 |
| 4.711999999999811 | 121.49 | 70.769 | 10.473 |
| 4.713999999999811 | 121.747 | 70.928 | 10.518 |
| 4.715999999999811 | 122.005 | 71.087 | 10.563 |
| 4.717999999999811 | 122.263 | 71.246 | 10.608 |
| 4.71999999999981 | 122.522 | 71.406 | 10.654 |
| 4.72199999999981 | 122.781 | 71.566 | 10.699 |
| 4.72399999999981 | 123.04 | 71.726 | 10.744 |
| 4.72599999999981 | 123.299 | 71.887 | 10.79 |
| 4.72799999999981 | 123.559 | 72.047 | 10.836 |
| 4.72999999999981 | 123.819 | 72.208 | 10.881 |
| 4.73199999999981 | 124.079 | 72.369 | 10.927 |
| 4.733999999999808 | 124.34 | 72.53 | 10.973 |
| 4.735999999999808 | 124.601 | 72.692 | 11.019 |
| 4.737999999999808 | 124.862 | 72.853 | 11.065 |
| 4.739999999999808 | 125.124 | 73.015 | 11.111 |
| 4.741999999999808 | 125.386 | 73.177 | 11.158 |
| 4.743999999999807 | 125.648 | 73.34 | 11.204 |
| 4.745999999999807 | 125.911 | 73.502 | 11.25 |
| 4.747999999999807 | 126.174 | 73.665 | 11.297 |
| 4.749999999999807 | 126.437 | 73.828 | 11.344 |
| 4.751999999999806 | 126.701 | 73.991 | 11.391 |
| 4.753999999999806 | 126.965 | 74.155 | 11.437 |
| 4.755999999999806 | 127.229 | 74.318 | 11.484 |
| 4.757999999999806 | 127.494 | 74.482 | 11.532 |
| 4.759999999999806 | 127.759 | 74.647 | 11.579 |
| 4.761999999999805 | 128.024 | 74.811 | 11.626 |
| 4.763999999999805 | 128.29 | 74.975 | 11.673 |
| 4.765999999999805 | 128.556 | 75.14 | 11.721 |
| 4.767999999999805 | 128.822 | 75.305 | 11.769 |
| 4.769999999999804 | 129.089 | 75.47 | 11.816 |
| 4.771999999999804 | 129.356 | 75.636 | 11.864 |
| 4.773999999999804 | 129.623 | 75.802 | 11.912 |
| 4.775999999999804 | 129.891 | 75.968 | 11.96 |
| 4.777999999999804 | 130.159 | 76.134 | 12.008 |
| 4.779999999999803 | 130.427 | 76.3 | 12.056 |
| 4.781999999999803 | 130.696 | 76.467 | 12.105 |
| 4.783999999999803 | 130.965 | 76.633 | 12.153 |
| 4.785999999999803 | 131.234 | 76.8 | 12.202 |
| 4.787999999999803 | 131.503 | 76.968 | 12.25 |
| 4.789999999999802 | 131.773 | 77.135 | 12.299 |
| 4.791999999999802 | 132.044 | 77.303 | 12.348 |
| 4.793999999999802 | 132.314 | 77.471 | 12.397 |
| 4.795999999999802 | 132.585 | 77.639 | 12.446 |
| 4.797999999999802 | 132.856 | 77.807 | 12.495 |
| 4.799999999999801 | 133.128 | 77.976 | 12.544 |
| 4.801999999999801 | 133.4 | 78.145 | 12.593 |
| 4.803999999999801 | 133.672 | 78.314 | 12.643 |
| 4.805999999999801 | 133.945 | 78.483 | 12.692 |
| 4.807999999999801 | 134.218 | 78.653 | 12.742 |
| 4.8099999999998 | 134.491 | 78.822 | 12.792 |
| 4.8119999999998 | 134.765 | 78.992 | 12.842 |
| 4.8139999999998 | 135.038 | 79.163 | 12.891 |
| 4.8159999999998 | 135.313 | 79.333 | 12.942 |
| 4.8179999999998 | 135.587 | 79.504 | 12.992 |
| 4.8199999999998 | 135.862 | 79.675 | 13.042 |
| 4.821999999999799 | 136.138 | 79.846 | 13.092 |
| 4.823999999999799 | 136.413 | 80.017 | 13.143 |
| 4.825999999999799 | 136.689 | 80.188 | 13.193 |
| 4.827999999999799 | 136.965 | 80.36 | 13.244 |
| 4.829999999999798 | 137.242 | 80.532 | 13.295 |
| 4.831999999999798 | 137.519 | 80.704 | 13.346 |
| 4.833999999999798 | 137.796 | 80.877 | 13.397 |
| 4.835999999999798 | 138.074 | 81.05 | 13.448 |
| 4.837999999999798 | 138.352 | 81.223 | 13.499 |
| 4.839999999999797 | 138.63 | 81.396 | 13.55 |
| 4.841999999999797 | 138.909 | 81.569 | 13.602 |
| 4.843999999999797 | 139.188 | 81.743 | 13.653 |
| 4.845999999999797 | 139.467 | 81.917 | 13.705 |
| 4.847999999999796 | 139.747 | 82.091 | 13.756 |
| 4.849999999999796 | 140.026 | 82.265 | 13.808 |
| 4.851999999999796 | 140.307 | 82.439 | 13.86 |
| 4.853999999999796 | 140.587 | 82.614 | 13.912 |
| 4.855999999999796 | 140.868 | 82.789 | 13.964 |
| 4.857999999999795 | 141.15 | 82.964 | 14.017 |
| 4.859999999999795 | 141.431 | 83.14 | 14.069 |
| 4.861999999999795 | 141.713 | 83.315 | 14.121 |
| 4.863999999999795 | 141.996 | 83.491 | 14.174 |
| 4.865999999999794 | 142.278 | 83.667 | 14.227 |
| 4.867999999999794 | 142.561 | 83.844 | 14.279 |
| 4.869999999999794 | 142.845 | 84.02 | 14.332 |
| 4.871999999999794 | 143.129 | 84.197 | 14.385 |
| 4.873999999999794 | 143.413 | 84.374 | 14.438 |
| 4.875999999999793 | 143.697 | 84.552 | 14.491 |
| 4.877999999999793 | 143.982 | 84.729 | 14.545 |
| 4.879999999999793 | 144.267 | 84.907 | 14.598 |
| 4.881999999999793 | 144.552 | 85.085 | 14.652 |
| 4.883999999999792 | 144.838 | 85.263 | 14.705 |
| 4.885999999999792 | 145.124 | 85.441 | 14.759 |
| 4.887999999999792 | 145.41 | 85.62 | 14.813 |
| 4.889999999999792 | 145.697 | 85.799 | 14.867 |
| 4.891999999999792 | 145.984 | 85.978 | 14.921 |
| 4.893999999999791 | 146.272 | 86.158 | 14.975 |
| 4.895999999999791 | 146.559 | 86.337 | 15.029 |
| 4.897999999999791 | 146.848 | 86.517 | 15.084 |
| 4.899999999999791 | 147.136 | 86.697 | 15.138 |
| 4.90199999999979 | 147.425 | 86.877 | 15.193 |
| 4.90399999999979 | 147.714 | 87.058 | 15.247 |
| 4.90599999999979 | 148.003 | 87.239 | 15.302 |
| 4.90799999999979 | 148.293 | 87.42 | 15.357 |
| 4.90999999999979 | 148.583 | 87.601 | 15.412 |
| 4.91199999999979 | 148.874 | 87.782 | 15.467 |
| 4.91399999999979 | 149.165 | 87.964 | 15.522 |
| 4.915999999999789 | 149.456 | 88.146 | 15.578 |
| 4.917999999999789 | 149.748 | 88.328 | 15.633 |
| 4.919999999999788 | 150.04 | 88.51 | 15.689 |
| 4.921999999999788 | 150.332 | 88.693 | 15.744 |
| 4.923999999999788 | 150.624 | 88.876 | 15.8 |
| 4.925999999999788 | 150.917 | 89.059 | 15.856 |
| 4.927999999999788 | 151.211 | 89.242 | 15.912 |
| 4.929999999999787 | 151.504 | 89.426 | 15.968 |
| 4.931999999999787 | 151.798 | 89.61 | 16.024 |
| 4.933999999999786 | 152.093 | 89.794 | 16.08 |
| 4.935999999999786 | 152.387 | 89.978 | 16.137 |
| 4.937999999999786 | 152.682 | 90.163 | 16.193 |
| 4.939999999999786 | 152.978 | 90.347 | 16.25 |
| 4.941999999999786 | 153.273 | 90.532 | 16.307 |
| 4.943999999999785 | 153.569 | 90.718 | 16.364 |
| 4.945999999999785 | 153.866 | 90.903 | 16.421 |
| 4.947999999999785 | 154.162 | 91.089 | 16.478 |
| 4.949999999999785 | 154.459 | 91.275 | 16.535 |
| 4.951999999999784 | 154.757 | 91.461 | 16.592 |
| 4.953999999999784 | 155.055 | 91.647 | 16.649 |
| 4.955999999999784 | 155.353 | 91.834 | 16.707 |
| 4.957999999999784 | 155.651 | 92.021 | 16.765 |
| 4.959999999999784 | 155.95 | 92.208 | 16.822 |
| 4.961999999999784 | 156.249 | 92.395 | 16.88 |
| 4.963999999999784 | 156.549 | 92.583 | 16.938 |
| 4.965999999999783 | 156.849 | 92.771 | 16.996 |
| 4.967999999999783 | 157.149 | 92.959 | 17.054 |
| 4.969999999999783 | 157.449 | 93.147 | 17.113 |
| 4.971999999999782 | 157.75 | 93.335 | 17.171 |
| 4.973999999999782 | 158.052 | 93.524 | 17.229 |
| 4.975999999999782 | 158.353 | 93.713 | 17.288 |
| 4.977999999999782 | 158.655 | 93.902 | 17.347 |
| 4.979999999999781 | 158.958 | 94.092 | 17.406 |
| 4.981999999999781 | 159.26 | 94.282 | 17.465 |
| 4.983999999999781 | 159.563 | 94.472 | 17.524 |
| 4.985999999999781 | 159.867 | 94.662 | 17.583 |
| 4.987999999999781 | 160.17 | 94.852 | 17.642 |
| 4.98999999999978 | 160.474 | 95.043 | 17.701 |
| 4.99199999999978 | 160.779 | 95.234 | 17.761 |
| 4.99399999999978 | 161.084 | 95.425 | 17.821 |
| 4.99599999999978 | 161.389 | 95.616 | 17.88 |
| 4.99799999999978 | 161.694 | 95.808 | 17.94 |
| 4.99999999999978 | 162 | 96 | 18 |
| 5.00199999999978 | 162.306 | 96.192 | 18.06 |
| 5.00399999999978 | 162.613 | 96.384 | 18.12 |
| 5.00599999999978 | 162.92 | 96.577 | 18.181 |
| 5.007999999999779 | 163.227 | 96.77 | 18.241 |
| 5.009999999999778 | 163.534 | 96.963 | 18.301 |
| 5.011999999999778 | 163.842 | 97.156 | 18.362 |
| 5.013999999999778 | 164.151 | 97.35 | 18.423 |
| 5.015999999999778 | 164.459 | 97.544 | 18.484 |
| 5.017999999999778 | 164.768 | 97.738 | 18.545 |
| 5.019999999999777 | 165.078 | 97.932 | 18.606 |
| 5.021999999999777 | 165.387 | 98.127 | 18.667 |
| 5.023999999999777 | 165.697 | 98.321 | 18.728 |
| 5.025999999999777 | 166.008 | 98.516 | 18.789 |
| 5.027999999999777 | 166.319 | 98.712 | 18.851 |
| 5.029999999999776 | 166.63 | 98.907 | 18.913 |
| 5.031999999999776 | 166.941 | 99.103 | 18.974 |
| 5.033999999999775 | 167.253 | 99.299 | 19.036 |
| 5.035999999999775 | 167.565 | 99.495 | 19.098 |
| 5.037999999999775 | 167.878 | 99.691 | 19.16 |
| 5.039999999999775 | 168.191 | 99.888 | 19.223 |
| 5.041999999999775 | 168.504 | 100.085 | 19.285 |
| 5.043999999999774 | 168.818 | 100.282 | 19.347 |
| 5.045999999999774 | 169.131 | 100.48 | 19.41 |
| 5.047999999999774 | 169.446 | 100.677 | 19.472 |
| 5.049999999999774 | 169.76 | 100.875 | 19.535 |
| 5.051999999999774 | 170.076 | 101.074 | 19.598 |
| 5.053999999999774 | 170.391 | 101.272 | 19.661 |
| 5.055999999999774 | 170.707 | 101.471 | 19.724 |
| 5.057999999999773 | 171.023 | 101.67 | 19.787 |
| 5.059999999999773 | 171.339 | 101.869 | 19.851 |
| 5.061999999999773 | 171.656 | 102.068 | 19.914 |
| 5.063999999999773 | 171.973 | 102.268 | 19.978 |
| 5.065999999999772 | 172.291 | 102.468 | 20.042 |
| 5.067999999999772 | 172.609 | 102.668 | 20.105 |
| 5.069999999999772 | 172.927 | 102.868 | 20.169 |
| 5.071999999999771 | 173.246 | 103.069 | 20.233 |
| 5.073999999999771 | 173.565 | 103.269 | 20.297 |
| 5.075999999999771 | 173.884 | 103.471 | 20.362 |
| 5.077999999999771 | 174.204 | 103.672 | 20.426 |
| 5.07999999999977 | 174.524 | 103.874 | 20.491 |
| 5.08199999999977 | 174.844 | 104.075 | 20.555 |
| 5.08399999999977 | 175.165 | 104.277 | 20.62 |
| 5.08599999999977 | 175.486 | 104.48 | 20.685 |
| 5.08799999999977 | 175.807 | 104.682 | 20.75 |
| 5.08999999999977 | 176.129 | 104.885 | 20.815 |
| 5.09199999999977 | 176.452 | 105.088 | 20.88 |
| 5.09399999999977 | 176.774 | 105.292 | 20.945 |
| 5.09599999999977 | 177.097 | 105.495 | 21.011 |
| 5.097999999999769 | 177.42 | 105.699 | 21.076 |
| 5.099999999999768 | 177.744 | 105.903 | 21.142 |
| 5.101999999999768 | 178.068 | 106.107 | 21.208 |
| 5.103999999999768 | 178.392 | 106.312 | 21.274 |
| 5.105999999999768 | 178.717 | 106.517 | 21.34 |
| 5.107999999999768 | 179.042 | 106.722 | 21.406 |
| 5.109999999999767 | 179.368 | 106.927 | 21.472 |
| 5.111999999999767 | 179.694 | 107.133 | 21.538 |
| 5.113999999999767 | 180.02 | 107.338 | 21.605 |
| 5.115999999999767 | 180.346 | 107.544 | 21.672 |
| 5.117999999999767 | 180.673 | 107.751 | 21.738 |
| 5.119999999999766 | 181.001 | 107.957 | 21.805 |
| 5.121999999999766 | 181.328 | 108.164 | 21.872 |
| 5.123999999999766 | 181.656 | 108.371 | 21.939 |
| 5.125999999999766 | 181.985 | 108.578 | 22.006 |
| 5.127999999999766 | 182.313 | 108.786 | 22.074 |
| 5.129999999999765 | 182.642 | 108.994 | 22.141 |
| 5.131999999999765 | 182.972 | 109.202 | 22.209 |
| 5.133999999999764 | 183.302 | 109.41 | 22.276 |
| 5.135999999999764 | 183.632 | 109.618 | 22.344 |
| 5.137999999999764 | 183.962 | 109.827 | 22.412 |
| 5.139999999999764 | 184.293 | 110.036 | 22.48 |
| 5.141999999999764 | 184.625 | 110.246 | 22.548 |
| 5.143999999999764 | 184.956 | 110.455 | 22.616 |
| 5.145999999999764 | 185.288 | 110.665 | 22.685 |
| 5.147999999999763 | 185.621 | 110.875 | 22.753 |
| 5.149999999999763 | 185.953 | 111.085 | 22.822 |
| 5.151999999999763 | 186.287 | 111.296 | 22.89 |
| 5.153999999999763 | 186.62 | 111.506 | 22.959 |
| 5.155999999999763 | 186.954 | 111.717 | 23.028 |
| 5.157999999999762 | 187.288 | 111.929 | 23.097 |
| 5.159999999999762 | 187.623 | 112.14 | 23.167 |
| 5.161999999999762 | 187.958 | 112.352 | 23.236 |
| 5.163999999999762 | 188.293 | 112.564 | 23.305 |
| 5.165999999999761 | 188.629 | 112.776 | 23.375 |
| 5.167999999999761 | 188.965 | 112.989 | 23.445 |
| 5.169999999999761 | 189.301 | 113.202 | 23.514 |
| 5.17199999999976 | 189.638 | 113.415 | 23.584 |
| 5.17399999999976 | 189.975 | 113.628 | 23.654 |
| 5.17599999999976 | 190.313 | 113.842 | 23.725 |
| 5.17799999999976 | 190.651 | 114.055 | 23.795 |
| 5.17999999999976 | 190.989 | 114.269 | 23.865 |
| 5.18199999999976 | 191.328 | 114.484 | 23.936 |
| 5.183999999999759 | 191.667 | 114.698 | 24.006 |
| 5.185999999999759 | 192.006 | 114.913 | 24.077 |
| 5.187999999999759 | 192.346 | 115.128 | 24.148 |
| 5.189999999999759 | 192.686 | 115.344 | 24.219 |
| 5.191999999999759 | 193.026 | 115.559 | 24.29 |
| 5.193999999999758 | 193.367 | 115.775 | 24.362 |
| 5.195999999999758 | 193.708 | 115.991 | 24.433 |
| 5.197999999999758 | 194.05 | 116.207 | 24.504 |
| 5.199999999999758 | 194.392 | 116.424 | 24.576 |
| 5.201999999999757 | 194.734 | 116.641 | 24.648 |
| 5.203999999999757 | 195.077 | 116.858 | 24.72 |
| 5.205999999999757 | 195.42 | 117.075 | 24.792 |
| 5.207999999999757 | 195.764 | 117.293 | 24.864 |
| 5.209999999999756 | 196.107 | 117.511 | 24.936 |
| 5.211999999999756 | 196.452 | 117.729 | 25.008 |
| 5.213999999999756 | 196.796 | 117.947 | 25.081 |
| 5.215999999999756 | 197.141 | 118.166 | 25.153 |
| 5.217999999999756 | 197.486 | 118.385 | 25.226 |
| 5.219999999999755 | 197.832 | 118.604 | 25.299 |
| 5.221999999999755 | 198.178 | 118.823 | 25.372 |
| 5.223999999999755 | 198.525 | 119.043 | 25.445 |
| 5.225999999999755 | 198.872 | 119.263 | 25.518 |
| 5.227999999999755 | 199.219 | 119.483 | 25.591 |
| 5.229999999999754 | 199.566 | 119.704 | 25.665 |
| 5.231999999999754 | 199.914 | 119.924 | 25.739 |
| 5.233999999999754 | 200.263 | 120.145 | 25.812 |
| 5.235999999999754 | 200.611 | 120.366 | 25.886 |
| 5.237999999999754 | 200.96 | 120.588 | 25.96 |
| 5.239999999999753 | 201.31 | 120.809 | 26.034 |
| 5.241999999999753 | 201.66 | 121.031 | 26.108 |
| 5.243999999999753 | 202.01 | 121.254 | 26.183 |
| 5.245999999999753 | 202.36 | 121.476 | 26.257 |
| 5.247999999999752 | 202.711 | 121.699 | 26.332 |
| 5.249999999999752 | 203.062 | 121.922 | 26.406 |
| 5.251999999999752 | 203.414 | 122.145 | 26.481 |
| 5.253999999999752 | 203.766 | 122.369 | 26.556 |
| 5.255999999999752 | 204.119 | 122.592 | 26.631 |
| 5.257999999999751 | 204.472 | 122.816 | 26.706 |
| 5.259999999999751 | 204.825 | 123.041 | 26.782 |
| 5.261999999999751 | 205.178 | 123.265 | 26.857 |
| 5.263999999999751 | 205.532 | 123.49 | 26.933 |
| 5.26599999999975 | 205.887 | 123.715 | 27.008 |
| 5.26799999999975 | 206.241 | 123.94 | 27.084 |
| 5.26999999999975 | 206.596 | 124.166 | 27.16 |
| 5.27199999999975 | 206.952 | 124.392 | 27.236 |
| 5.27399999999975 | 207.308 | 124.618 | 27.312 |
| 5.27599999999975 | 207.664 | 124.844 | 27.389 |
| 5.27799999999975 | 208.02 | 125.071 | 27.465 |
| 5.279999999999748 | 208.377 | 125.298 | 27.542 |
| 5.281999999999748 | 208.735 | 125.525 | 27.618 |
| 5.283999999999748 | 209.092 | 125.752 | 27.695 |
| 5.285999999999748 | 209.451 | 125.98 | 27.772 |
| 5.287999999999748 | 209.809 | 126.208 | 27.849 |
| 5.289999999999747 | 210.168 | 126.436 | 27.926 |
| 5.291999999999747 | 210.527 | 126.665 | 28.003 |
| 5.293999999999747 | 210.887 | 126.893 | 28.081 |
| 5.295999999999747 | 211.247 | 127.122 | 28.158 |
| 5.297999999999747 | 211.607 | 127.352 | 28.236 |
| 5.299999999999746 | 211.968 | 127.581 | 28.314 |
| 5.301999999999746 | 212.329 | 127.811 | 28.392 |
| 5.303999999999746 | 212.691 | 128.041 | 28.47 |
| 5.305999999999746 | 213.053 | 128.271 | 28.548 |
| 5.307999999999746 | 213.415 | 128.502 | 28.627 |
| 5.309999999999745 | 213.778 | 128.732 | 28.705 |
| 5.311999999999745 | 214.141 | 128.963 | 28.784 |
| 5.313999999999745 | 214.504 | 129.195 | 28.862 |
| 5.315999999999745 | 214.868 | 129.426 | 28.941 |
| 5.317999999999745 | 215.232 | 129.658 | 29.02 |
| 5.319999999999744 | 215.597 | 129.89 | 29.099 |
| 5.321999999999744 | 215.962 | 130.123 | 29.178 |
| 5.323999999999744 | 216.327 | 130.355 | 29.258 |
| 5.325999999999744 | 216.693 | 130.588 | 29.337 |
| 5.327999999999744 | 217.059 | 130.821 | 29.417 |
| 5.329999999999743 | 217.425 | 131.055 | 29.496 |
| 5.331999999999743 | 217.792 | 131.289 | 29.576 |
| 5.333999999999743 | 218.16 | 131.522 | 29.656 |
| 5.335999999999743 | 218.527 | 131.757 | 29.736 |
| 5.337999999999742 | 218.895 | 131.991 | 29.817 |
| 5.339999999999742 | 219.264 | 132.226 | 29.897 |
| 5.341999999999742 | 219.632 | 132.461 | 29.977 |
| 5.343999999999742 | 220.002 | 132.696 | 30.058 |
| 5.345999999999742 | 220.371 | 132.932 | 30.139 |
| 5.347999999999741 | 220.741 | 133.168 | 30.22 |
| 5.349999999999741 | 221.111 | 133.404 | 30.301 |
| 5.351999999999741 | 221.482 | 133.64 | 30.382 |
| 5.353999999999741 | 221.853 | 133.877 | 30.463 |
| 5.35599999999974 | 222.225 | 134.113 | 30.545 |
| 5.35799999999974 | 222.597 | 134.351 | 30.626 |
| 5.35999999999974 | 222.969 | 134.588 | 30.708 |
| 5.36199999999974 | 223.342 | 134.826 | 30.789 |
| 5.36399999999974 | 223.715 | 135.064 | 30.871 |
| 5.365999999999739 | 224.088 | 135.302 | 30.953 |
| 5.367999999999739 | 224.462 | 135.54 | 31.036 |
| 5.369999999999739 | 224.836 | 135.779 | 31.118 |
| 5.371999999999738 | 225.211 | 136.018 | 31.2 |
| 5.373999999999738 | 225.586 | 136.257 | 31.283 |
| 5.375999999999738 | 225.961 | 136.497 | 31.366 |
| 5.377999999999738 | 226.337 | 136.737 | 31.448 |
| 5.379999999999737 | 226.713 | 136.977 | 31.531 |
| 5.381999999999737 | 227.09 | 137.217 | 31.614 |
| 5.383999999999737 | 227.467 | 137.458 | 31.698 |
| 5.385999999999737 | 227.844 | 137.698 | 31.781 |
| 5.387999999999737 | 228.222 | 137.94 | 31.864 |
| 5.389999999999736 | 228.6 | 138.181 | 31.948 |
| 5.391999999999736 | 228.978 | 138.423 | 32.032 |
| 5.393999999999736 | 229.357 | 138.665 | 32.116 |
| 5.395999999999736 | 229.736 | 138.907 | 32.2 |
| 5.397999999999736 | 230.116 | 139.149 | 32.284 |
| 5.399999999999735 | 230.496 | 139.392 | 32.368 |
| 5.401999999999735 | 230.876 | 139.635 | 32.452 |
| 5.403999999999735 | 231.257 | 139.878 | 32.537 |
| 5.405999999999734 | 231.638 | 140.122 | 32.622 |
| 5.407999999999734 | 232.02 | 140.366 | 32.706 |
| 5.409999999999734 | 232.402 | 140.61 | 32.791 |
| 5.411999999999734 | 232.784 | 140.854 | 32.876 |
| 5.413999999999734 | 233.167 | 141.099 | 32.961 |
| 5.415999999999734 | 233.55 | 141.344 | 33.047 |
| 5.417999999999734 | 233.934 | 141.589 | 33.132 |
| 5.419999999999733 | 234.318 | 141.834 | 33.218 |
| 5.421999999999733 | 234.702 | 142.08 | 33.303 |
| 5.423999999999733 | 235.087 | 142.326 | 33.389 |
| 5.425999999999733 | 235.472 | 142.572 | 33.475 |
| 5.427999999999733 | 235.858 | 142.819 | 33.561 |
| 5.429999999999732 | 236.244 | 143.066 | 33.648 |
| 5.431999999999732 | 236.63 | 143.313 | 33.734 |
| 5.433999999999731 | 237.017 | 143.56 | 33.82 |
| 5.435999999999731 | 237.404 | 143.808 | 33.907 |
| 5.437999999999731 | 237.791 | 144.055 | 33.994 |
| 5.43999999999973 | 238.179 | 144.304 | 34.081 |
| 5.44199999999973 | 238.567 | 144.552 | 34.168 |
| 5.44399999999973 | 238.956 | 144.801 | 34.255 |
| 5.44599999999973 | 239.345 | 145.05 | 34.342 |
| 5.44799999999973 | 239.735 | 145.299 | 34.43 |
| 5.44999999999973 | 240.124 | 145.548 | 34.517 |
| 5.45199999999973 | 240.515 | 145.798 | 34.605 |
| 5.45399999999973 | 240.905 | 146.048 | 34.693 |
| 5.45599999999973 | 241.296 | 146.299 | 34.781 |
| 5.45799999999973 | 241.688 | 146.549 | 34.869 |
| 5.45999999999973 | 242.08 | 146.8 | 34.957 |
| 5.461999999999728 | 242.472 | 147.051 | 35.045 |
| 5.463999999999728 | 242.865 | 147.303 | 35.134 |
| 5.465999999999728 | 243.258 | 147.554 | 35.223 |
| 5.467999999999728 | 243.651 | 147.806 | 35.311 |
| 5.469999999999727 | 244.045 | 148.058 | 35.4 |
| 5.471999999999727 | 244.439 | 148.311 | 35.489 |
| 5.473999999999727 | 244.834 | 148.564 | 35.578 |
| 5.475999999999727 | 245.229 | 148.817 | 35.668 |
| 5.477999999999727 | 245.624 | 149.07 | 35.757 |
| 5.479999999999726 | 246.02 | 149.324 | 35.847 |
| 5.481999999999726 | 246.416 | 149.578 | 35.936 |
| 5.483999999999726 | 246.813 | 149.832 | 36.026 |
| 5.485999999999726 | 247.21 | 150.086 | 36.116 |
| 5.487999999999725 | 247.607 | 150.341 | 36.206 |
| 5.489999999999725 | 248.005 | 150.596 | 36.297 |
| 5.491999999999725 | 248.403 | 150.851 | 36.387 |
| 5.493999999999725 | 248.802 | 151.107 | 36.478 |
| 5.495999999999725 | 249.201 | 151.363 | 36.568 |
| 5.497999999999724 | 249.6 | 151.619 | 36.659 |
| 5.499999999999724 | 250 | 151.875 | 36.75 |
| 5.501999999999724 | 250.4 | 152.132 | 36.841 |
| 5.503999999999724 | 250.801 | 152.389 | 36.932 |
| 5.505999999999724 | 251.202 | 152.646 | 37.024 |
| 5.507999999999724 | 251.603 | 152.903 | 37.115 |
| 5.509999999999723 | 252.005 | 153.161 | 37.207 |
| 5.511999999999723 | 252.407 | 153.419 | 37.298 |
| 5.513999999999723 | 252.81 | 153.677 | 37.39 |
| 5.515999999999723 | 253.213 | 153.936 | 37.482 |
| 5.517999999999723 | 253.616 | 154.195 | 37.575 |
| 5.519999999999722 | 254.02 | 154.454 | 37.667 |
| 5.521999999999722 | 254.424 | 154.713 | 37.759 |
| 5.523999999999722 | 254.829 | 154.973 | 37.852 |
| 5.525999999999722 | 255.234 | 155.233 | 37.945 |
| 5.527999999999722 | 255.639 | 155.493 | 38.037 |
| 5.529999999999721 | 256.045 | 155.754 | 38.13 |
| 5.53199999999972 | 256.451 | 156.014 | 38.223 |
| 5.53399999999972 | 256.858 | 156.275 | 38.317 |
| 5.53599999999972 | 257.265 | 156.537 | 38.41 |
| 5.53799999999972 | 257.672 | 156.798 | 38.504 |
| 5.53999999999972 | 258.08 | 157.06 | 38.597 |
| 5.54199999999972 | 258.488 | 157.323 | 38.691 |
| 5.54399999999972 | 258.897 | 157.585 | 38.785 |
| 5.54599999999972 | 259.306 | 157.848 | 38.879 |
| 5.547999999999719 | 259.716 | 158.111 | 38.973 |
| 5.54999999999972 | 260.125 | 158.374 | 39.068 |
| 5.551999999999719 | 260.536 | 158.638 | 39.162 |
| 5.553999999999719 | 260.946 | 158.902 | 39.257 |
| 5.555999999999718 | 261.358 | 159.166 | 39.352 |
| 5.557999999999718 | 261.769 | 159.43 | 39.447 |
| 5.559999999999718 | 262.181 | 159.695 | 39.542 |
| 5.561999999999718 | 262.593 | 159.96 | 39.637 |
| 5.563999999999718 | 263.006 | 160.225 | 39.732 |
| 5.565999999999717 | 263.419 | 160.491 | 39.828 |
| 5.567999999999717 | 263.832 | 160.756 | 39.923 |
| 5.569999999999717 | 264.246 | 161.023 | 40.019 |
| 5.571999999999716 | 264.661 | 161.289 | 40.115 |
| 5.573999999999716 | 265.075 | 161.556 | 40.211 |
| 5.575999999999716 | 265.491 | 161.823 | 40.307 |
| 5.577999999999716 | 265.906 | 162.09 | 40.403 |
| 5.579999999999715 | 266.322 | 162.357 | 40.5 |
| 5.581999999999715 | 266.738 | 162.625 | 40.596 |
| 5.583999999999715 | 267.155 | 162.893 | 40.693 |
| 5.585999999999715 | 267.572 | 163.162 | 40.79 |
| 5.587999999999715 | 267.99 | 163.43 | 40.887 |
| 5.589999999999714 | 268.408 | 163.699 | 40.984 |
| 5.591999999999714 | 268.826 | 163.968 | 41.081 |
| 5.593999999999714 | 269.245 | 164.238 | 41.179 |
| 5.595999999999714 | 269.664 | 164.508 | 41.276 |
| 5.597999999999714 | 270.084 | 164.778 | 41.374 |
| 5.599999999999714 | 270.504 | 165.048 | 41.472 |
| 5.601999999999713 | 270.924 | 165.319 | 41.57 |
| 5.603999999999713 | 271.345 | 165.59 | 41.668 |
| 5.605999999999713 | 271.767 | 165.861 | 41.766 |
| 5.607999999999713 | 272.188 | 166.132 | 41.865 |
| 5.609999999999712 | 272.61 | 166.404 | 41.963 |
| 5.611999999999712 | 273.033 | 166.676 | 42.062 |
| 5.613999999999712 | 273.456 | 166.948 | 42.161 |
| 5.615999999999712 | 273.879 | 167.221 | 42.26 |
| 5.617999999999712 | 274.303 | 167.494 | 42.359 |
| 5.619999999999711 | 274.727 | 167.767 | 42.458 |
| 5.621999999999711 | 275.151 | 168.04 | 42.558 |
| 5.623999999999711 | 275.576 | 168.314 | 42.657 |
| 5.625999999999711 | 276.002 | 168.588 | 42.757 |
| 5.62799999999971 | 276.428 | 168.863 | 42.857 |
| 5.62999999999971 | 276.854 | 169.137 | 42.957 |
| 5.63199999999971 | 277.28 | 169.412 | 43.057 |
| 5.63399999999971 | 277.707 | 169.687 | 43.157 |
| 5.63599999999971 | 278.135 | 169.963 | 43.257 |
| 5.637999999999709 | 278.563 | 170.238 | 43.358 |
| 5.63999999999971 | 278.991 | 170.514 | 43.459 |
| 5.641999999999709 | 279.42 | 170.791 | 43.56 |
| 5.643999999999709 | 279.849 | 171.067 | 43.66 |
| 5.645999999999708 | 280.278 | 171.344 | 43.762 |
| 5.647999999999708 | 280.708 | 171.621 | 43.863 |
| 5.649999999999708 | 281.138 | 171.899 | 43.964 |
| 5.651999999999708 | 281.569 | 172.177 | 44.066 |
| 5.653999999999708 | 282 | 172.455 | 44.167 |
| 5.655999999999707 | 282.432 | 172.733 | 44.269 |
| 5.657999999999707 | 282.864 | 173.012 | 44.371 |
| 5.659999999999707 | 283.296 | 173.29 | 44.473 |
| 5.661999999999707 | 283.729 | 173.57 | 44.576 |
| 5.663999999999707 | 284.162 | 173.849 | 44.678 |
| 5.665999999999706 | 284.596 | 174.129 | 44.781 |
| 5.667999999999706 | 285.03 | 174.409 | 44.883 |
| 5.669999999999706 | 285.465 | 174.689 | 44.986 |
| 5.671999999999705 | 285.9 | 174.97 | 45.089 |
| 5.673999999999705 | 286.335 | 175.251 | 45.192 |
| 5.675999999999705 | 286.771 | 175.532 | 45.295 |
| 5.677999999999705 | 287.207 | 175.814 | 45.399 |
| 5.679999999999704 | 287.643 | 176.095 | 45.502 |
| 5.681999999999704 | 288.08 | 176.377 | 45.606 |
| 5.683999999999704 | 288.518 | 176.66 | 45.71 |
| 5.685999999999704 | 288.956 | 176.942 | 45.814 |
| 5.687999999999704 | 289.394 | 177.225 | 45.918 |
| 5.689999999999704 | 289.832 | 177.509 | 46.022 |
| 5.691999999999703 | 290.272 | 177.792 | 46.127 |
| 5.693999999999703 | 290.711 | 178.076 | 46.231 |
| 5.695999999999703 | 291.151 | 178.36 | 46.336 |
| 5.697999999999703 | 291.591 | 178.644 | 46.441 |
| 5.699999999999703 | 292.032 | 178.929 | 46.546 |
| 5.701999999999702 | 292.473 | 179.214 | 46.651 |
| 5.703999999999702 | 292.915 | 179.499 | 46.756 |
| 5.705999999999702 | 293.357 | 179.785 | 46.862 |
| 5.707999999999702 | 293.799 | 180.071 | 46.967 |
| 5.709999999999701 | 294.242 | 180.357 | 47.073 |
| 5.711999999999701 | 294.685 | 180.643 | 47.179 |
| 5.713999999999701 | 295.129 | 180.93 | 47.285 |
| 5.715999999999701 | 295.573 | 181.217 | 47.391 |
| 5.717999999999701 | 296.018 | 181.504 | 47.498 |
| 5.7199999999997 | 296.463 | 181.792 | 47.604 |
| 5.7219999999997 | 296.908 | 182.08 | 47.711 |
| 5.7239999999997 | 297.354 | 182.368 | 47.817 |
| 5.7259999999997 | 297.8 | 182.656 | 47.924 |
| 5.727999999999699 | 298.247 | 182.945 | 48.031 |
| 5.7299999999997 | 298.694 | 183.234 | 48.139 |
| 5.7319999999997 | 299.141 | 183.523 | 48.246 |
| 5.733999999999698 | 299.589 | 183.813 | 48.353 |
| 5.735999999999698 | 300.037 | 184.103 | 48.461 |
| 5.737999999999698 | 300.486 | 184.393 | 48.569 |
| 5.739999999999698 | 300.935 | 184.684 | 48.677 |
| 5.741999999999697 | 301.385 | 184.974 | 48.785 |
| 5.743999999999697 | 301.835 | 185.266 | 48.893 |
| 5.745999999999697 | 302.285 | 185.557 | 49.002 |
| 5.747999999999697 | 302.736 | 185.849 | 49.11 |
| 5.749999999999697 | 303.187 | 186.141 | 49.219 |
| 5.751999999999696 | 303.639 | 186.433 | 49.328 |
| 5.753999999999696 | 304.091 | 186.725 | 49.437 |
| 5.755999999999696 | 304.544 | 187.018 | 49.546 |
| 5.757999999999696 | 304.997 | 187.311 | 49.655 |
| 5.759999999999695 | 305.45 | 187.605 | 49.764 |
| 5.761999999999695 | 305.904 | 187.899 | 49.874 |
| 5.763999999999695 | 306.358 | 188.193 | 49.984 |
| 5.765999999999695 | 306.813 | 188.487 | 50.093 |
| 5.767999999999695 | 307.268 | 188.782 | 50.204 |
| 5.769999999999694 | 307.724 | 189.077 | 50.314 |
| 5.771999999999694 | 308.18 | 189.372 | 50.424 |
| 5.773999999999694 | 308.636 | 189.667 | 50.534 |
| 5.775999999999694 | 309.093 | 189.963 | 50.645 |
| 5.777999999999694 | 309.55 | 190.259 | 50.756 |
| 5.779999999999693 | 310.008 | 190.556 | 50.867 |
| 5.781999999999693 | 310.466 | 190.852 | 50.978 |
| 5.783999999999693 | 310.924 | 191.149 | 51.089 |
| 5.785999999999693 | 311.383 | 191.447 | 51.2 |
| 5.787999999999693 | 311.843 | 191.744 | 51.312 |
| 5.789999999999692 | 312.303 | 192.042 | 51.423 |
| 5.791999999999692 | 312.763 | 192.34 | 51.535 |
| 5.793999999999692 | 313.223 | 192.639 | 51.647 |
| 5.795999999999692 | 313.685 | 192.938 | 51.759 |
| 5.797999999999692 | 314.146 | 193.237 | 51.872 |
| 5.799999999999691 | 314.608 | 193.536 | 51.984 |
| 5.801999999999691 | 315.07 | 193.836 | 52.097 |
| 5.803999999999691 | 315.533 | 194.136 | 52.209 |
| 5.805999999999691 | 315.996 | 194.436 | 52.322 |
| 5.807999999999691 | 316.46 | 194.736 | 52.435 |
| 5.80999999999969 | 316.924 | 195.037 | 52.548 |
| 5.81199999999969 | 317.389 | 195.338 | 52.662 |
| 5.81399999999969 | 317.854 | 195.64 | 52.775 |
| 5.81599999999969 | 318.319 | 195.942 | 52.889 |
| 5.81799999999969 | 318.785 | 196.244 | 53.002 |
| 5.81999999999969 | 319.251 | 196.546 | 53.116 |
| 5.82199999999969 | 319.718 | 196.849 | 53.23 |
| 5.823999999999689 | 320.185 | 197.152 | 53.345 |
| 5.825999999999689 | 320.652 | 197.455 | 53.459 |
| 5.827999999999688 | 321.12 | 197.759 | 53.574 |
| 5.829999999999688 | 321.589 | 198.062 | 53.688 |
| 5.831999999999688 | 322.058 | 198.367 | 53.803 |
| 5.833999999999687 | 322.527 | 198.671 | 53.918 |
| 5.835999999999687 | 322.997 | 198.976 | 54.033 |
| 5.837999999999687 | 323.467 | 199.281 | 54.148 |
| 5.839999999999687 | 323.937 | 199.586 | 54.264 |
| 5.841999999999686 | 324.408 | 199.892 | 54.379 |
| 5.843999999999686 | 324.88 | 200.198 | 54.495 |
| 5.845999999999686 | 325.351 | 200.504 | 54.611 |
| 5.847999999999686 | 325.824 | 200.811 | 54.727 |
| 5.849999999999686 | 326.296 | 201.117 | 54.843 |
| 5.851999999999685 | 326.77 | 201.425 | 54.96 |
| 5.853999999999685 | 327.243 | 201.732 | 55.076 |
| 5.855999999999685 | 327.717 | 202.04 | 55.193 |
| 5.857999999999685 | 328.192 | 202.348 | 55.31 |
| 5.859999999999684 | 328.667 | 202.656 | 55.427 |
| 5.861999999999684 | 329.142 | 202.965 | 55.544 |
| 5.863999999999684 | 329.618 | 203.274 | 55.661 |
| 5.865999999999684 | 330.094 | 203.583 | 55.778 |
| 5.867999999999684 | 330.571 | 203.893 | 55.896 |
| 5.869999999999684 | 331.048 | 204.203 | 56.014 |
| 5.871999999999683 | 331.525 | 204.513 | 56.131 |
| 5.873999999999683 | 332.003 | 204.823 | 56.25 |
| 5.875999999999683 | 332.481 | 205.134 | 56.368 |
| 5.877999999999683 | 332.96 | 205.445 | 56.486 |
| 5.879999999999682 | 333.439 | 205.756 | 56.605 |
| 5.881999999999682 | 333.919 | 206.068 | 56.723 |
| 5.883999999999682 | 334.399 | 206.38 | 56.842 |
| 5.885999999999682 | 334.88 | 206.692 | 56.961 |
| 5.887999999999682 | 335.361 | 207.005 | 57.08 |
| 5.889999999999681 | 335.842 | 207.318 | 57.199 |
| 5.891999999999681 | 336.324 | 207.631 | 57.319 |
| 5.893999999999681 | 336.806 | 207.945 | 57.438 |
| 5.895999999999681 | 337.289 | 208.258 | 57.558 |
| 5.897999999999681 | 337.772 | 208.573 | 57.678 |
| 5.89999999999968 | 338.256 | 208.887 | 57.798 |
| 5.90199999999968 | 338.74 | 209.202 | 57.918 |
| 5.90399999999968 | 339.225 | 209.517 | 58.039 |
| 5.90599999999968 | 339.709 | 209.832 | 58.159 |
| 5.90799999999968 | 340.195 | 210.148 | 58.28 |
| 5.90999999999968 | 340.681 | 210.464 | 58.401 |
| 5.91199999999968 | 341.167 | 210.78 | 58.522 |
| 5.91399999999968 | 341.654 | 211.097 | 58.643 |
| 5.915999999999678 | 342.141 | 211.413 | 58.764 |
| 5.917999999999678 | 342.628 | 211.731 | 58.885 |
| 5.919999999999678 | 343.116 | 212.048 | 59.007 |
| 5.921999999999678 | 343.605 | 212.366 | 59.129 |
| 5.923999999999677 | 344.094 | 212.684 | 59.251 |
| 5.925999999999677 | 344.583 | 213.002 | 59.373 |
| 5.927999999999677 | 345.073 | 213.321 | 59.495 |
| 5.929999999999677 | 345.563 | 213.64 | 59.617 |
| 5.931999999999677 | 346.054 | 213.959 | 59.74 |
| 5.933999999999676 | 346.545 | 214.279 | 59.863 |
| 5.935999999999676 | 347.036 | 214.599 | 59.985 |
| 5.937999999999676 | 347.528 | 214.919 | 60.108 |
| 5.939999999999676 | 348.021 | 215.24 | 60.232 |
| 5.941999999999675 | 348.514 | 215.561 | 60.355 |
| 5.943999999999675 | 349.007 | 215.882 | 60.478 |
| 5.945999999999675 | 349.501 | 216.203 | 60.602 |
| 5.947999999999675 | 349.995 | 216.525 | 60.726 |
| 5.949999999999675 | 350.489 | 216.847 | 60.85 |
| 5.951999999999674 | 350.985 | 217.17 | 60.974 |
| 5.953999999999674 | 351.48 | 217.492 | 61.098 |
| 5.955999999999674 | 351.976 | 217.815 | 61.223 |
| 5.957999999999674 | 352.472 | 218.139 | 61.347 |
| 5.959999999999673 | 352.969 | 218.462 | 61.472 |
| 5.961999999999673 | 353.467 | 218.786 | 61.597 |
| 5.963999999999673 | 353.964 | 219.11 | 61.722 |
| 5.965999999999673 | 354.463 | 219.435 | 61.847 |
| 5.967999999999673 | 354.961 | 219.76 | 61.972 |
| 5.969999999999672 | 355.46 | 220.085 | 62.098 |
| 5.971999999999672 | 355.96 | 220.411 | 62.224 |
| 5.973999999999672 | 356.46 | 220.736 | 62.349 |
| 5.975999999999672 | 356.96 | 221.062 | 62.475 |
| 5.977999999999671 | 357.461 | 221.389 | 62.602 |
| 5.97999999999967 | 357.962 | 221.716 | 62.728 |
| 5.98199999999967 | 358.464 | 222.043 | 62.854 |
| 5.98399999999967 | 358.966 | 222.37 | 62.981 |
| 5.98599999999967 | 359.469 | 222.698 | 63.108 |
| 5.98799999999967 | 359.972 | 223.026 | 63.235 |
| 5.98999999999967 | 360.476 | 223.354 | 63.362 |
| 5.99199999999967 | 360.98 | 223.682 | 63.489 |
| 5.99399999999967 | 361.484 | 224.011 | 63.617 |
| 5.99599999999967 | 361.989 | 224.341 | 63.744 |
| 5.99799999999967 | 362.494 | 224.67 | 63.872 |
| 5.99999999999967 | 363 | 225 | 64 |
| 6.00199999999967 | 363.506 | 225.33 | 64.128 |
| 6.00399999999967 | 364.013 | 225.661 | 64.256 |
| 6.005999999999668 | 364.52 | 225.991 | 64.385 |
| 6.007999999999668 | 365.028 | 226.322 | 64.513 |
| 6.009999999999668 | 365.536 | 226.654 | 64.642 |
| 6.011999999999668 | 366.044 | 226.986 | 64.771 |
| 6.013999999999668 | 366.553 | 227.318 | 64.9 |
| 6.015999999999667 | 367.062 | 227.65 | 65.029 |
| 6.017999999999667 | 367.572 | 227.983 | 65.158 |
| 6.019999999999667 | 368.082 | 228.316 | 65.288 |
| 6.021999999999667 | 368.593 | 228.649 | 65.418 |
| 6.023999999999666 | 369.104 | 228.983 | 65.548 |
| 6.025999999999666 | 369.616 | 229.316 | 65.678 |
| 6.027999999999666 | 370.128 | 229.651 | 65.808 |
| 6.029999999999666 | 370.641 | 229.985 | 65.938 |
| 6.031999999999666 | 371.153 | 230.32 | 66.069 |
| 6.033999999999665 | 371.667 | 230.655 | 66.199 |
| 6.035999999999665 | 372.181 | 230.991 | 66.33 |
| 6.037999999999665 | 372.695 | 231.326 | 66.461 |
| 6.039999999999665 | 373.21 | 231.663 | 66.592 |
| 6.041999999999664 | 373.725 | 231.999 | 66.723 |
| 6.043999999999664 | 374.241 | 232.336 | 66.855 |
| 6.045999999999664 | 374.757 | 232.673 | 66.987 |
| 6.047999999999664 | 375.273 | 233.01 | 67.118 |
| 6.049999999999664 | 375.79 | 233.348 | 67.25 |
| 6.051999999999663 | 376.308 | 233.686 | 67.382 |
| 6.053999999999663 | 376.826 | 234.024 | 67.515 |
| 6.055999999999663 | 377.344 | 234.363 | 67.647 |
| 6.057999999999663 | 377.863 | 234.702 | 67.78 |
| 6.059999999999662 | 378.382 | 235.041 | 67.912 |
| 6.061999999999662 | 378.902 | 235.381 | 68.045 |
| 6.063999999999662 | 379.422 | 235.721 | 68.178 |
| 6.065999999999662 | 379.943 | 236.061 | 68.312 |
| 6.067999999999662 | 380.464 | 236.401 | 68.445 |
| 6.069999999999661 | 380.986 | 236.742 | 68.579 |
| 6.07199999999966 | 381.508 | 237.083 | 68.712 |
| 6.07399999999966 | 382.03 | 237.425 | 68.846 |
| 6.07599999999966 | 382.553 | 237.767 | 68.98 |
| 6.07799999999966 | 383.077 | 238.109 | 69.115 |
| 6.07999999999966 | 383.6 | 238.451 | 69.249 |
| 6.08199999999966 | 384.125 | 238.794 | 69.384 |
| 6.08399999999966 | 384.65 | 239.137 | 69.518 |
| 6.08599999999966 | 385.175 | 239.48 | 69.653 |
| 6.08799999999966 | 385.7 | 239.824 | 69.788 |
| 6.08999999999966 | 386.227 | 240.168 | 69.923 |
| 6.09199999999966 | 386.753 | 240.512 | 70.059 |
| 6.09399999999966 | 387.28 | 240.857 | 70.194 |
| 6.095999999999659 | 387.808 | 241.202 | 70.33 |
| 6.097999999999659 | 388.336 | 241.547 | 70.466 |
| 6.099999999999658 | 388.864 | 241.893 | 70.602 |
| 6.101999999999658 | 389.393 | 242.239 | 70.738 |
| 6.103999999999658 | 389.922 | 242.585 | 70.875 |
| 6.105999999999658 | 390.452 | 242.932 | 71.011 |
| 6.107999999999658 | 390.982 | 243.279 | 71.148 |
| 6.109999999999657 | 391.513 | 243.626 | 71.285 |
| 6.111999999999657 | 392.044 | 243.973 | 71.422 |
| 6.113999999999657 | 392.576 | 244.321 | 71.559 |
| 6.115999999999657 | 393.108 | 244.669 | 71.696 |
| 6.117999999999657 | 393.64 | 245.018 | 71.834 |
| 6.119999999999656 | 394.173 | 245.367 | 71.971 |
| 6.121999999999656 | 394.707 | 245.716 | 72.109 |
| 6.123999999999656 | 395.241 | 246.065 | 72.247 |
| 6.125999999999656 | 395.775 | 246.415 | 72.386 |
| 6.127999999999655 | 396.31 | 246.765 | 72.524 |
| 6.129999999999655 | 396.845 | 247.116 | 72.662 |
| 6.131999999999655 | 397.381 | 247.466 | 72.801 |
| 6.133999999999654 | 397.917 | 247.818 | 72.94 |
| 6.135999999999654 | 398.454 | 248.169 | 73.079 |
| 6.137999999999654 | 398.991 | 248.521 | 73.218 |
| 6.139999999999654 | 399.529 | 248.873 | 73.357 |
| 6.141999999999654 | 400.067 | 249.225 | 73.497 |
| 6.143999999999654 | 400.605 | 249.578 | 73.637 |
| 6.145999999999654 | 401.144 | 249.931 | 73.777 |
| 6.147999999999653 | 401.684 | 250.284 | 73.917 |
| 6.149999999999653 | 402.223 | 250.638 | 74.057 |
| 6.151999999999653 | 402.764 | 250.992 | 74.197 |
| 6.153999999999653 | 403.305 | 251.346 | 74.338 |
| 6.155999999999652 | 403.846 | 251.7 | 74.478 |
| 6.157999999999652 | 404.388 | 252.055 | 74.619 |
| 6.159999999999652 | 404.93 | 252.411 | 74.76 |
| 6.161999999999652 | 405.473 | 252.766 | 74.901 |
| 6.163999999999652 | 406.016 | 253.122 | 75.043 |
| 6.165999999999651 | 406.559 | 253.478 | 75.184 |
| 6.167999999999651 | 407.104 | 253.835 | 75.326 |
| 6.169999999999651 | 407.648 | 254.192 | 75.468 |
| 6.17199999999965 | 408.193 | 254.549 | 75.61 |
| 6.17399999999965 | 408.739 | 254.907 | 75.752 |
| 6.17599999999965 | 409.284 | 255.264 | 75.894 |
| 6.17799999999965 | 409.831 | 255.623 | 76.037 |
| 6.17999999999965 | 410.378 | 255.981 | 76.18 |
| 6.18199999999965 | 410.925 | 256.34 | 76.323 |
| 6.18399999999965 | 411.473 | 256.699 | 76.466 |
| 6.18599999999965 | 412.021 | 257.059 | 76.609 |
| 6.187999999999649 | 412.57 | 257.418 | 76.752 |
| 6.189999999999648 | 413.119 | 257.778 | 76.896 |
| 6.191999999999648 | 413.669 | 258.139 | 77.039 |
| 6.193999999999648 | 414.219 | 258.5 | 77.183 |
| 6.195999999999648 | 414.769 | 258.861 | 77.327 |
| 6.197999999999648 | 415.32 | 259.222 | 77.472 |
| 6.199999999999647 | 415.872 | 259.584 | 77.616 |
| 6.201999999999647 | 416.424 | 259.946 | 77.761 |
| 6.203999999999647 | 416.976 | 260.308 | 77.905 |
| 6.205999999999646 | 417.529 | 260.671 | 78.05 |
| 6.207999999999646 | 418.083 | 261.034 | 78.195 |
| 6.209999999999646 | 418.637 | 261.398 | 78.341 |
| 6.211999999999646 | 419.191 | 261.761 | 78.486 |
| 6.213999999999646 | 419.746 | 262.125 | 78.632 |
| 6.215999999999645 | 420.301 | 262.49 | 78.777 |
| 6.217999999999645 | 420.857 | 262.855 | 78.923 |
| 6.219999999999645 | 421.413 | 263.22 | 79.069 |
| 6.221999999999645 | 421.97 | 263.585 | 79.216 |
| 6.223999999999644 | 422.527 | 263.951 | 79.362 |
| 6.225999999999644 | 423.084 | 264.317 | 79.509 |
| 6.227999999999644 | 423.643 | 264.683 | 79.655 |
| 6.229999999999644 | 424.201 | 265.05 | 79.802 |
| 6.231999999999644 | 424.76 | 265.417 | 79.949 |
| 6.233999999999643 | 425.32 | 265.784 | 80.097 |
| 6.235999999999643 | 425.88 | 266.152 | 80.244 |
| 6.237999999999643 | 426.44 | 266.52 | 80.392 |
| 6.239999999999643 | 427.001 | 266.888 | 80.54 |
| 6.241999999999642 | 427.562 | 267.257 | 80.688 |
| 6.243999999999642 | 428.124 | 267.625 | 80.836 |
| 6.245999999999642 | 428.686 | 267.995 | 80.984 |
| 6.247999999999642 | 429.249 | 268.364 | 81.133 |
| 6.249999999999642 | 429.812 | 268.734 | 81.281 |
| 6.251999999999641 | 430.376 | 269.105 | 81.43 |
| 6.253999999999641 | 430.94 | 269.475 | 81.579 |
| 6.255999999999641 | 431.505 | 269.846 | 81.728 |
| 6.257999999999641 | 432.07 | 270.218 | 81.878 |
| 6.25999999999964 | 432.636 | 270.589 | 82.027 |
| 6.26199999999964 | 433.202 | 270.961 | 82.177 |
| 6.26399999999964 | 433.769 | 271.333 | 82.327 |
| 6.26599999999964 | 434.336 | 271.706 | 82.477 |
| 6.26799999999964 | 434.903 | 272.079 | 82.627 |
| 6.26999999999964 | 435.471 | 272.452 | 82.777 |
| 6.27199999999964 | 436.04 | 272.826 | 82.928 |
| 6.27399999999964 | 436.609 | 273.2 | 83.079 |
| 6.27599999999964 | 437.178 | 273.574 | 83.23 |
| 6.277999999999638 | 437.748 | 273.949 | 83.381 |
| 6.279999999999638 | 438.318 | 274.323 | 83.532 |
| 6.281999999999638 | 438.889 | 274.699 | 83.683 |
| 6.283999999999638 | 439.46 | 275.074 | 83.835 |
| 6.285999999999638 | 440.032 | 275.45 | 83.987 |
| 6.287999999999637 | 440.604 | 275.826 | 84.139 |
| 6.289999999999637 | 441.177 | 276.203 | 84.291 |
| 6.291999999999637 | 441.75 | 276.58 | 84.443 |
| 6.293999999999637 | 442.324 | 276.957 | 84.596 |
| 6.295999999999636 | 442.898 | 277.335 | 84.748 |
| 6.297999999999636 | 443.473 | 277.713 | 84.901 |
| 6.299999999999636 | 444.048 | 278.091 | 85.054 |
| 6.301999999999636 | 444.624 | 278.47 | 85.207 |
| 6.303999999999636 | 445.2 | 278.849 | 85.361 |
| 6.305999999999635 | 445.776 | 279.228 | 85.514 |
| 6.307999999999635 | 446.353 | 279.607 | 85.668 |
| 6.309999999999635 | 446.931 | 279.987 | 85.822 |
| 6.311999999999635 | 447.509 | 280.368 | 85.976 |
| 6.313999999999634 | 448.087 | 280.748 | 86.13 |
| 6.315999999999634 | 448.666 | 281.129 | 86.284 |
| 6.317999999999634 | 449.246 | 281.51 | 86.439 |
| 6.319999999999634 | 449.825 | 281.892 | 86.594 |
| 6.321999999999634 | 450.406 | 282.274 | 86.748 |
| 6.323999999999634 | 450.987 | 282.656 | 86.904 |
| 6.325999999999634 | 451.568 | 283.039 | 87.059 |
| 6.327999999999633 | 452.15 | 283.422 | 87.214 |
| 6.329999999999633 | 452.732 | 283.805 | 87.37 |
| 6.331999999999632 | 453.315 | 284.189 | 87.526 |
| 6.333999999999632 | 453.898 | 284.572 | 87.682 |
| 6.335999999999632 | 454.482 | 284.957 | 87.838 |
| 6.337999999999632 | 455.066 | 285.341 | 87.994 |
| 6.339999999999632 | 455.651 | 285.726 | 88.151 |
| 6.341999999999631 | 456.236 | 286.112 | 88.307 |
| 6.343999999999631 | 456.822 | 286.497 | 88.464 |
| 6.345999999999631 | 457.408 | 286.883 | 88.621 |
| 6.347999999999631 | 457.994 | 287.269 | 88.778 |
| 6.34999999999963 | 458.581 | 287.656 | 88.936 |
| 6.35199999999963 | 459.169 | 288.043 | 89.093 |
| 6.35399999999963 | 459.757 | 288.43 | 89.251 |
| 6.35599999999963 | 460.346 | 288.818 | 89.409 |
| 6.35799999999963 | 460.935 | 289.206 | 89.567 |
| 6.35999999999963 | 461.524 | 289.594 | 89.725 |
| 6.36199999999963 | 462.114 | 289.983 | 89.884 |
| 6.36399999999963 | 462.705 | 290.372 | 90.042 |
| 6.36599999999963 | 463.296 | 290.761 | 90.201 |
| 6.36799999999963 | 463.887 | 291.151 | 90.36 |
| 6.369999999999628 | 464.479 | 291.541 | 90.519 |
| 6.371999999999628 | 465.071 | 291.931 | 90.679 |
| 6.373999999999628 | 465.664 | 292.322 | 90.838 |
| 6.375999999999628 | 466.258 | 292.713 | 90.998 |
| 6.377999999999627 | 466.852 | 293.105 | 91.158 |
| 6.379999999999627 | 467.446 | 293.496 | 91.318 |
| 6.381999999999627 | 468.041 | 293.888 | 91.478 |
| 6.383999999999627 | 468.636 | 294.281 | 91.638 |
| 6.385999999999627 | 469.232 | 294.673 | 91.799 |
| 6.387999999999626 | 469.828 | 295.066 | 91.96 |
| 6.389999999999626 | 470.425 | 295.46 | 92.121 |
| 6.391999999999626 | 471.022 | 295.854 | 92.282 |
| 6.393999999999626 | 471.62 | 296.248 | 92.443 |
| 6.395999999999625 | 472.218 | 296.642 | 92.605 |
| 6.397999999999625 | 472.817 | 297.037 | 92.766 |
| 6.399999999999625 | 473.416 | 297.432 | 92.928 |
| 6.401999999999625 | 474.016 | 297.827 | 93.09 |
| 6.403999999999625 | 474.616 | 298.223 | 93.252 |
| 6.405999999999624 | 475.217 | 298.619 | 93.415 |
| 6.407999999999624 | 475.818 | 299.016 | 93.577 |
| 6.409999999999624 | 476.419 | 299.413 | 93.74 |
| 6.411999999999624 | 477.021 | 299.81 | 93.903 |
| 6.413999999999623 | 477.624 | 300.207 | 94.066 |
| 6.415999999999623 | 478.227 | 300.605 | 94.229 |
| 6.417999999999623 | 478.831 | 301.003 | 94.393 |
| 6.419999999999623 | 479.435 | 301.402 | 94.556 |
| 6.421999999999623 | 480.039 | 301.801 | 94.72 |
| 6.423999999999622 | 480.644 | 302.2 | 94.884 |
| 6.425999999999622 | 481.25 | 302.599 | 95.048 |
| 6.427999999999622 | 481.856 | 302.999 | 95.212 |
| 6.429999999999622 | 482.462 | 303.4 | 95.377 |
| 6.43199999999962 | 483.069 | 303.8 | 95.542 |
| 6.43399999999962 | 483.677 | 304.201 | 95.707 |
| 6.43599999999962 | 484.285 | 304.602 | 95.872 |
| 6.43799999999962 | 484.893 | 305.004 | 96.037 |
| 6.43999999999962 | 485.502 | 305.406 | 96.202 |
| 6.44199999999962 | 486.112 | 305.808 | 96.368 |
| 6.44399999999962 | 486.722 | 306.211 | 96.534 |
| 6.44599999999962 | 487.332 | 306.614 | 96.7 |
| 6.44799999999962 | 487.943 | 307.017 | 96.866 |
| 6.44999999999962 | 488.554 | 307.421 | 97.032 |
| 6.45199999999962 | 489.166 | 307.825 | 97.199 |
| 6.45399999999962 | 489.779 | 308.229 | 97.365 |
| 6.45599999999962 | 490.392 | 308.634 | 97.532 |
| 6.45799999999962 | 491.005 | 309.039 | 97.699 |
| 6.459999999999618 | 491.619 | 309.444 | 97.867 |
| 6.461999999999618 | 492.233 | 309.85 | 98.034 |
| 6.463999999999618 | 492.848 | 310.256 | 98.202 |
| 6.465999999999618 | 493.464 | 310.663 | 98.37 |
| 6.467999999999618 | 494.079 | 311.069 | 98.537 |
| 6.469999999999617 | 494.696 | 311.477 | 98.706 |
| 6.471999999999617 | 495.313 | 311.884 | 98.874 |
| 6.473999999999617 | 495.93 | 312.292 | 99.043 |
| 6.475999999999617 | 496.548 | 312.7 | 99.211 |
| 6.477999999999616 | 497.166 | 313.109 | 99.38 |
| 6.479999999999616 | 497.785 | 313.517 | 99.549 |
| 6.481999999999616 | 498.404 | 313.927 | 99.718 |
| 6.483999999999616 | 499.024 | 314.336 | 99.888 |
| 6.485999999999616 | 499.644 | 314.746 | 100.058 |
| 6.487999999999615 | 500.265 | 315.156 | 100.227 |
| 6.489999999999615 | 500.886 | 315.567 | 100.397 |
| 6.491999999999615 | 501.508 | 315.978 | 100.567 |
| 6.493999999999615 | 502.13 | 316.389 | 100.738 |
| 6.495999999999614 | 502.753 | 316.801 | 100.908 |
| 6.497999999999614 | 503.376 | 317.213 | 101.079 |
| 6.499999999999614 | 504 | 317.625 | 101.25 |
| 6.501999999999614 | 504.624 | 318.038 | 101.421 |
| 6.503999999999614 | 505.249 | 318.451 | 101.592 |
| 6.505999999999614 | 505.874 | 318.864 | 101.764 |
| 6.507999999999614 | 506.5 | 319.278 | 101.935 |
| 6.509999999999613 | 507.126 | 319.692 | 102.107 |
| 6.511999999999613 | 507.753 | 320.106 | 102.279 |
| 6.513999999999613 | 508.38 | 320.521 | 102.452 |
| 6.515999999999613 | 509.008 | 320.936 | 102.624 |
| 6.517999999999613 | 509.636 | 321.352 | 102.796 |
| 6.519999999999612 | 510.265 | 321.767 | 102.969 |
| 6.521999999999612 | 510.894 | 322.184 | 103.142 |
| 6.523999999999612 | 511.524 | 322.6 | 103.315 |
| 6.525999999999612 | 512.154 | 323.017 | 103.489 |
| 6.527999999999611 | 512.785 | 323.434 | 103.662 |
| 6.529999999999611 | 513.416 | 323.852 | 103.836 |
| 6.53199999999961 | 514.048 | 324.27 | 104.01 |
| 6.53399999999961 | 514.68 | 324.688 | 104.184 |
| 6.53599999999961 | 515.313 | 325.107 | 104.358 |
| 6.53799999999961 | 515.946 | 325.525 | 104.532 |
| 6.53999999999961 | 516.579 | 325.945 | 104.707 |
| 6.54199999999961 | 517.214 | 326.364 | 104.882 |
| 6.54399999999961 | 517.848 | 326.784 | 105.057 |
| 6.54599999999961 | 518.484 | 327.205 | 105.232 |
| 6.54799999999961 | 519.119 | 327.626 | 105.407 |
| 6.54999999999961 | 519.755 | 328.047 | 105.583 |
| 6.551999999999608 | 520.392 | 328.468 | 105.758 |
| 6.553999999999608 | 521.029 | 328.89 | 105.934 |
| 6.555999999999608 | 521.667 | 329.312 | 106.11 |
| 6.557999999999608 | 522.305 | 329.734 | 106.287 |
| 6.559999999999607 | 522.944 | 330.157 | 106.463 |
| 6.561999999999607 | 523.583 | 330.58 | 106.64 |
| 6.563999999999607 | 524.223 | 331.004 | 106.817 |
| 6.565999999999607 | 524.863 | 331.428 | 106.994 |
| 6.567999999999607 | 525.504 | 331.852 | 107.171 |
| 6.569999999999606 | 526.145 | 332.277 | 107.348 |
| 6.571999999999606 | 526.787 | 332.702 | 107.526 |
| 6.573999999999606 | 527.429 | 333.127 | 107.704 |
| 6.575999999999606 | 528.072 | 333.553 | 107.882 |
| 6.577999999999605 | 528.715 | 333.979 | 108.06 |
| 6.579999999999605 | 529.359 | 334.405 | 108.238 |
| 6.581999999999605 | 530.003 | 334.832 | 108.417 |
| 6.583999999999605 | 530.648 | 335.259 | 108.595 |
| 6.585999999999605 | 531.293 | 335.686 | 108.774 |
| 6.587999999999604 | 531.939 | 336.114 | 108.953 |
| 6.589999999999604 | 532.585 | 336.542 | 109.133 |
| 6.591999999999604 | 533.232 | 336.971 | 109.312 |
| 6.593999999999604 | 533.879 | 337.399 | 109.492 |
| 6.595999999999604 | 534.527 | 337.829 | 109.672 |
| 6.597999999999604 | 535.175 | 338.258 | 109.852 |
| 6.599999999999603 | 535.824 | 338.688 | 110.032 |
| 6.601999999999603 | 536.473 | 339.118 | 110.212 |
| 6.603999999999603 | 537.123 | 339.549 | 110.393 |
| 6.605999999999603 | 537.773 | 339.98 | 110.574 |
| 6.607999999999603 | 538.424 | 340.411 | 110.755 |
| 6.609999999999602 | 539.076 | 340.843 | 110.936 |
| 6.611999999999602 | 539.727 | 341.275 | 111.117 |
| 6.613999999999602 | 540.38 | 341.707 | 111.299 |
| 6.615999999999602 | 541.033 | 342.14 | 111.481 |
| 6.617999999999601 | 541.686 | 342.573 | 111.663 |
| 6.619999999999601 | 542.34 | 343.007 | 111.845 |
| 6.621999999999601 | 542.994 | 343.44 | 112.027 |
| 6.623999999999601 | 543.649 | 343.875 | 112.209 |
| 6.625999999999601 | 544.304 | 344.309 | 112.392 |
| 6.6279999999996 | 544.96 | 344.744 | 112.575 |
| 6.6299999999996 | 545.617 | 345.179 | 112.758 |
| 6.6319999999996 | 546.273 | 345.615 | 112.941 |
| 6.6339999999996 | 546.931 | 346.051 | 113.125 |
| 6.635999999999599 | 547.589 | 346.487 | 113.308 |
| 6.637999999999599 | 548.247 | 346.924 | 113.492 |
| 6.6399999999996 | 548.906 | 347.361 | 113.676 |
| 6.641999999999599 | 549.566 | 347.798 | 113.86 |
| 6.643999999999599 | 550.226 | 348.236 | 114.045 |
| 6.645999999999598 | 550.886 | 348.674 | 114.229 |
| 6.647999999999598 | 551.547 | 349.113 | 114.414 |
| 6.649999999999598 | 552.208 | 349.551 | 114.599 |
| 6.651999999999598 | 552.87 | 349.991 | 114.784 |
| 6.653999999999597 | 553.533 | 350.43 | 114.97 |
| 6.655999999999597 | 554.196 | 350.87 | 115.155 |
| 6.657999999999597 | 554.86 | 351.31 | 115.341 |
| 6.659999999999597 | 555.524 | 351.751 | 115.527 |
| 6.661999999999597 | 556.188 | 352.192 | 115.713 |
| 6.663999999999596 | 556.853 | 352.633 | 115.899 |
| 6.665999999999596 | 557.519 | 353.075 | 116.086 |
| 6.667999999999596 | 558.185 | 353.517 | 116.273 |
| 6.669999999999596 | 558.851 | 353.959 | 116.46 |
| 6.671999999999595 | 559.519 | 354.402 | 116.647 |
| 6.673999999999595 | 560.186 | 354.845 | 116.834 |
| 6.675999999999595 | 560.854 | 355.289 | 117.021 |
| 6.677999999999595 | 561.523 | 355.733 | 117.209 |
| 6.679999999999594 | 562.192 | 356.177 | 117.397 |
| 6.681999999999594 | 562.862 | 356.621 | 117.585 |
| 6.683999999999594 | 563.532 | 357.066 | 117.773 |
| 6.685999999999594 | 564.203 | 357.512 | 117.962 |
| 6.687999999999594 | 564.874 | 357.957 | 118.15 |
| 6.689999999999593 | 565.546 | 358.403 | 118.339 |
| 6.691999999999593 | 566.218 | 358.85 | 118.528 |
| 6.693999999999593 | 566.891 | 359.297 | 118.717 |
| 6.695999999999593 | 567.564 | 359.744 | 118.907 |
| 6.697999999999593 | 568.238 | 360.191 | 119.096 |
| 6.699999999999592 | 568.912 | 360.639 | 119.286 |
| 6.701999999999592 | 569.587 | 361.087 | 119.476 |
| 6.703999999999592 | 570.262 | 361.536 | 119.666 |
| 6.705999999999592 | 570.938 | 361.985 | 119.857 |
| 6.707999999999592 | 571.614 | 362.434 | 120.047 |
| 6.709999999999591 | 572.291 | 362.884 | 120.238 |
| 6.711999999999591 | 572.969 | 363.334 | 120.429 |
| 6.713999999999591 | 573.647 | 363.784 | 120.62 |
| 6.715999999999591 | 574.325 | 364.235 | 120.811 |
| 6.71799999999959 | 575.004 | 364.686 | 121.003 |
| 6.71999999999959 | 575.683 | 365.137 | 121.194 |
| 6.72199999999959 | 576.363 | 365.589 | 121.386 |
| 6.72399999999959 | 577.044 | 366.041 | 121.579 |
| 6.72599999999959 | 577.725 | 366.494 | 121.771 |
| 6.727999999999589 | 578.406 | 366.947 | 121.963 |
| 6.72999999999959 | 579.088 | 367.4 | 122.156 |
| 6.731999999999588 | 579.771 | 367.854 | 122.349 |
| 6.733999999999588 | 580.454 | 368.308 | 122.542 |
| 6.735999999999588 | 581.138 | 368.762 | 122.735 |
| 6.737999999999588 | 581.822 | 369.217 | 122.929 |
| 6.739999999999588 | 582.506 | 369.672 | 123.122 |
| 6.741999999999587 | 583.192 | 370.128 | 123.316 |
| 6.743999999999587 | 583.877 | 370.583 | 123.51 |
| 6.745999999999587 | 584.564 | 371.04 | 123.705 |
| 6.747999999999587 | 585.25 | 371.496 | 123.899 |
| 6.749999999999586 | 585.937 | 371.953 | 124.094 |
| 6.751999999999586 | 586.625 | 372.41 | 124.289 |
| 6.753999999999586 | 587.314 | 372.868 | 124.484 |
| 6.755999999999586 | 588.002 | 373.326 | 124.679 |
| 6.757999999999586 | 588.692 | 373.785 | 124.874 |
| 6.759999999999585 | 589.382 | 374.243 | 125.07 |
| 6.761999999999585 | 590.072 | 374.702 | 125.266 |
| 6.763999999999585 | 590.763 | 375.162 | 125.462 |
| 6.765999999999585 | 591.454 | 375.622 | 125.658 |
| 6.767999999999585 | 592.146 | 376.082 | 125.854 |
| 6.769999999999584 | 592.839 | 376.543 | 126.051 |
| 6.771999999999584 | 593.532 | 377.004 | 126.248 |
| 6.773999999999584 | 594.225 | 377.465 | 126.445 |
| 6.775999999999584 | 594.919 | 377.927 | 126.642 |
| 6.777999999999584 | 595.614 | 378.389 | 126.84 |
| 6.779999999999583 | 596.309 | 378.851 | 127.037 |
| 6.781999999999583 | 597.004 | 379.314 | 127.235 |
| 6.783999999999583 | 597.7 | 379.777 | 127.433 |
| 6.785999999999583 | 598.397 | 380.241 | 127.631 |
| 6.787999999999583 | 599.094 | 380.705 | 127.829 |
| 6.789999999999582 | 599.792 | 381.169 | 128.028 |
| 6.791999999999582 | 600.49 | 381.634 | 128.227 |
| 6.793999999999582 | 601.189 | 382.099 | 128.426 |
| 6.795999999999582 | 601.888 | 382.564 | 128.625 |
| 6.797999999999582 | 602.588 | 383.03 | 128.824 |
| 6.799999999999581 | 603.288 | 383.496 | 129.024 |
| 6.801999999999581 | 603.989 | 383.963 | 129.224 |
| 6.803999999999581 | 604.69 | 384.429 | 129.424 |
| 6.805999999999581 | 605.392 | 384.897 | 129.624 |
| 6.807999999999581 | 606.094 | 385.364 | 129.824 |
| 6.80999999999958 | 606.797 | 385.832 | 130.025 |
| 6.81199999999958 | 607.501 | 386.301 | 130.226 |
| 6.81399999999958 | 608.205 | 386.769 | 130.427 |
| 6.81599999999958 | 608.909 | 387.238 | 130.628 |
| 6.817999999999579 | 609.614 | 387.708 | 130.829 |
| 6.81999999999958 | 610.32 | 388.178 | 131.031 |
| 6.82199999999958 | 611.026 | 388.648 | 131.233 |
| 6.823999999999579 | 611.733 | 389.118 | 131.434 |
| 6.825999999999579 | 612.44 | 389.589 | 131.637 |
| 6.827999999999578 | 613.147 | 390.061 | 131.839 |
| 6.829999999999578 | 613.856 | 390.532 | 132.042 |
| 6.831999999999577 | 614.564 | 391.005 | 132.244 |
| 6.833999999999577 | 615.274 | 391.477 | 132.447 |
| 6.835999999999577 | 615.983 | 391.95 | 132.65 |
| 6.837999999999577 | 616.694 | 392.423 | 132.854 |
| 6.839999999999577 | 617.404 | 392.897 | 133.057 |
| 6.841999999999576 | 618.116 | 393.37 | 133.261 |
| 6.843999999999576 | 618.828 | 393.845 | 133.465 |
| 6.845999999999576 | 619.54 | 394.319 | 133.669 |
| 6.847999999999576 | 620.253 | 394.794 | 133.874 |
| 6.849999999999575 | 620.966 | 395.27 | 134.078 |
| 6.851999999999575 | 621.681 | 395.746 | 134.283 |
| 6.853999999999575 | 622.395 | 396.222 | 134.488 |
| 6.855999999999575 | 623.11 | 396.698 | 134.693 |
| 6.857999999999575 | 623.826 | 397.175 | 134.899 |
| 6.859999999999574 | 624.542 | 397.653 | 135.104 |
| 6.861999999999574 | 625.258 | 398.13 | 135.31 |
| 6.863999999999574 | 625.976 | 398.608 | 135.516 |
| 6.865999999999574 | 626.693 | 399.087 | 135.722 |
| 6.867999999999574 | 627.412 | 399.565 | 135.928 |
| 6.869999999999574 | 628.13 | 400.045 | 136.135 |
| 6.871999999999573 | 628.85 | 400.524 | 136.342 |
| 6.873999999999573 | 629.57 | 401.004 | 136.549 |
| 6.875999999999573 | 630.29 | 401.484 | 136.756 |
| 6.877999999999573 | 631.011 | 401.965 | 136.963 |
| 6.879999999999572 | 631.732 | 402.446 | 137.171 |
| 6.881999999999572 | 632.454 | 402.927 | 137.379 |
| 6.883999999999572 | 633.177 | 403.409 | 137.587 |
| 6.885999999999572 | 633.9 | 403.891 | 137.795 |
| 6.887999999999572 | 634.623 | 404.374 | 138.003 |
| 6.889999999999571 | 635.347 | 404.857 | 138.212 |
| 6.891999999999571 | 636.072 | 405.34 | 138.421 |
| 6.893999999999571 | 636.797 | 405.824 | 138.63 |
| 6.895999999999571 | 637.523 | 406.308 | 138.839 |
| 6.897999999999571 | 638.249 | 406.792 | 139.048 |
| 6.89999999999957 | 638.976 | 407.277 | 139.258 |
| 6.90199999999957 | 639.703 | 407.762 | 139.468 |
| 6.90399999999957 | 640.431 | 408.248 | 139.678 |
| 6.90599999999957 | 641.16 | 408.734 | 139.888 |
| 6.90799999999957 | 641.888 | 409.22 | 140.099 |
| 6.90999999999957 | 642.618 | 409.707 | 140.309 |
| 6.91199999999957 | 643.348 | 410.194 | 140.52 |
| 6.913999999999568 | 644.078 | 410.681 | 140.731 |
| 6.915999999999568 | 644.809 | 411.169 | 140.942 |
| 6.917999999999568 | 645.541 | 411.657 | 141.154 |
| 6.919999999999568 | 646.273 | 412.146 | 141.365 |
| 6.921999999999568 | 647.006 | 412.635 | 141.577 |
| 6.923999999999567 | 647.739 | 413.124 | 141.789 |
| 6.925999999999567 | 648.473 | 413.614 | 142.002 |
| 6.927999999999567 | 649.207 | 414.104 | 142.214 |
| 6.929999999999567 | 649.942 | 414.594 | 142.427 |
| 6.931999999999566 | 650.677 | 415.085 | 142.64 |
| 6.933999999999566 | 651.413 | 415.576 | 142.853 |
| 6.935999999999566 | 652.149 | 416.068 | 143.066 |
| 6.937999999999566 | 652.886 | 416.56 | 143.279 |
| 6.939999999999566 | 653.624 | 417.052 | 143.493 |
| 6.941999999999565 | 654.362 | 417.545 | 143.707 |
| 6.943999999999565 | 655.101 | 418.038 | 143.921 |
| 6.945999999999565 | 655.84 | 418.531 | 144.136 |
| 6.947999999999565 | 656.579 | 419.025 | 144.35 |
| 6.949999999999564 | 657.319 | 419.52 | 144.565 |
| 6.951999999999564 | 658.06 | 420.014 | 144.78 |
| 6.953999999999564 | 658.801 | 420.509 | 144.995 |
| 6.955999999999564 | 659.543 | 421.005 | 145.21 |
| 6.957999999999564 | 660.286 | 421.5 | 145.426 |
| 6.959999999999563 | 661.029 | 421.997 | 145.641 |
| 6.961999999999563 | 661.772 | 422.493 | 145.857 |
| 6.963999999999563 | 662.516 | 422.99 | 146.074 |
| 6.965999999999563 | 663.26 | 423.487 | 146.29 |
| 6.967999999999563 | 664.006 | 423.985 | 146.507 |
| 6.969999999999562 | 664.751 | 424.483 | 146.723 |
| 6.971999999999562 | 665.497 | 424.982 | 146.94 |
| 6.973999999999562 | 666.244 | 425.48 | 147.158 |
| 6.975999999999562 | 666.991 | 425.98 | 147.375 |
| 6.977999999999561 | 667.739 | 426.479 | 147.593 |
| 6.97999999999956 | 668.487 | 426.979 | 147.81 |
| 6.98199999999956 | 669.236 | 427.48 | 148.028 |
| 6.98399999999956 | 669.985 | 427.98 | 148.247 |
| 6.98599999999956 | 670.735 | 428.481 | 148.465 |
| 6.98799999999956 | 671.486 | 428.983 | 148.684 |
| 6.98999999999956 | 672.237 | 429.485 | 148.903 |
| 6.99199999999956 | 672.988 | 429.987 | 149.122 |
| 6.99399999999956 | 673.74 | 430.49 | 149.341 |
| 6.99599999999956 | 674.493 | 430.993 | 149.56 |
| 6.99799999999956 | 675.246 | 431.496 | 149.78 |
| 6.99999999999956 | 676 | 432 | 150 |